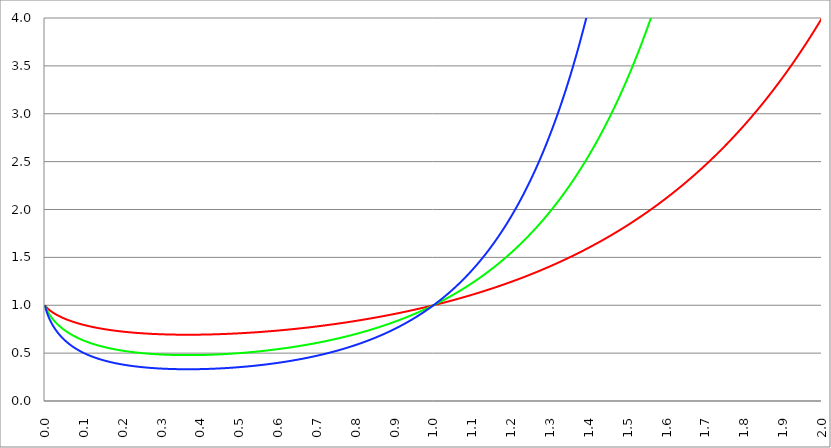
| Category | Series 1 | Series 0 | Series 2 |
|---|---|---|---|
| 0.0 | 1 | 1 | 1 |
| 0.001 | 0.993 | 0.986 | 0.979 |
| 0.002 | 0.988 | 0.975 | 0.963 |
| 0.003 | 0.983 | 0.966 | 0.949 |
| 0.004 | 0.978 | 0.957 | 0.936 |
| 0.005 | 0.974 | 0.948 | 0.924 |
| 0.006 | 0.97 | 0.94 | 0.912 |
| 0.007 | 0.966 | 0.933 | 0.901 |
| 0.008 | 0.962 | 0.926 | 0.891 |
| 0.009 | 0.958 | 0.919 | 0.881 |
| 0.01 | 0.955 | 0.912 | 0.871 |
| 0.011 | 0.952 | 0.906 | 0.862 |
| 0.012 | 0.948 | 0.899 | 0.853 |
| 0.013 | 0.945 | 0.893 | 0.844 |
| 0.014 | 0.942 | 0.887 | 0.836 |
| 0.015 | 0.939 | 0.882 | 0.828 |
| 0.016 | 0.936 | 0.876 | 0.82 |
| 0.017 | 0.933 | 0.871 | 0.812 |
| 0.018 | 0.93 | 0.865 | 0.805 |
| 0.019 | 0.927 | 0.86 | 0.798 |
| 0.02 | 0.925 | 0.855 | 0.791 |
| 0.021 | 0.922 | 0.85 | 0.784 |
| 0.022 | 0.919 | 0.845 | 0.777 |
| 0.023 | 0.917 | 0.841 | 0.771 |
| 0.024 | 0.914 | 0.836 | 0.764 |
| 0.025 | 0.912 | 0.832 | 0.758 |
| 0.026 | 0.909 | 0.827 | 0.752 |
| 0.027 | 0.907 | 0.823 | 0.746 |
| 0.028 | 0.905 | 0.819 | 0.741 |
| 0.029 | 0.902 | 0.814 | 0.735 |
| 0.03 | 0.9 | 0.81 | 0.729 |
| 0.031 | 0.898 | 0.806 | 0.724 |
| 0.032 | 0.896 | 0.802 | 0.719 |
| 0.033 | 0.894 | 0.798 | 0.713 |
| 0.034 | 0.891 | 0.795 | 0.708 |
| 0.035 | 0.889 | 0.791 | 0.703 |
| 0.036 | 0.887 | 0.787 | 0.698 |
| 0.037 | 0.885 | 0.784 | 0.694 |
| 0.038 | 0.883 | 0.78 | 0.689 |
| 0.039 | 0.881 | 0.776 | 0.684 |
| 0.04 | 0.879 | 0.773 | 0.68 |
| 0.041 | 0.877 | 0.77 | 0.675 |
| 0.042 | 0.875 | 0.766 | 0.671 |
| 0.043 | 0.873 | 0.763 | 0.666 |
| 0.044 | 0.872 | 0.76 | 0.662 |
| 0.045 | 0.87 | 0.756 | 0.658 |
| 0.046 | 0.868 | 0.753 | 0.654 |
| 0.047 | 0.866 | 0.75 | 0.65 |
| 0.048 | 0.864 | 0.747 | 0.646 |
| 0.049 | 0.863 | 0.744 | 0.642 |
| 0.05 | 0.861 | 0.741 | 0.638 |
| 0.051 | 0.859 | 0.738 | 0.634 |
| 0.052 | 0.857 | 0.735 | 0.631 |
| 0.053 | 0.856 | 0.732 | 0.627 |
| 0.054 | 0.854 | 0.73 | 0.623 |
| 0.055 | 0.853 | 0.727 | 0.62 |
| 0.056 | 0.851 | 0.724 | 0.616 |
| 0.057 | 0.849 | 0.721 | 0.613 |
| 0.058 | 0.848 | 0.719 | 0.609 |
| 0.059 | 0.846 | 0.716 | 0.606 |
| 0.06 | 0.845 | 0.713 | 0.603 |
| 0.061 | 0.843 | 0.711 | 0.599 |
| 0.062 | 0.842 | 0.708 | 0.596 |
| 0.063 | 0.84 | 0.706 | 0.593 |
| 0.064 | 0.839 | 0.703 | 0.59 |
| 0.065 | 0.837 | 0.701 | 0.587 |
| 0.066 | 0.836 | 0.699 | 0.584 |
| 0.067 | 0.834 | 0.696 | 0.581 |
| 0.068 | 0.833 | 0.694 | 0.578 |
| 0.069 | 0.832 | 0.691 | 0.575 |
| 0.07 | 0.83 | 0.689 | 0.572 |
| 0.071 | 0.829 | 0.687 | 0.569 |
| 0.072 | 0.827 | 0.685 | 0.566 |
| 0.073 | 0.826 | 0.682 | 0.564 |
| 0.074 | 0.825 | 0.68 | 0.561 |
| 0.075 | 0.823 | 0.678 | 0.558 |
| 0.076 | 0.822 | 0.676 | 0.556 |
| 0.077 | 0.821 | 0.674 | 0.553 |
| 0.078 | 0.82 | 0.672 | 0.55 |
| 0.079 | 0.818 | 0.67 | 0.548 |
| 0.08 | 0.817 | 0.668 | 0.545 |
| 0.081 | 0.816 | 0.666 | 0.543 |
| 0.082 | 0.815 | 0.664 | 0.541 |
| 0.083 | 0.813 | 0.662 | 0.538 |
| 0.084 | 0.812 | 0.66 | 0.536 |
| 0.085 | 0.811 | 0.658 | 0.533 |
| 0.086 | 0.81 | 0.656 | 0.531 |
| 0.087 | 0.809 | 0.654 | 0.529 |
| 0.088 | 0.807 | 0.652 | 0.526 |
| 0.089 | 0.806 | 0.65 | 0.524 |
| 0.09 | 0.805 | 0.648 | 0.522 |
| 0.091 | 0.804 | 0.646 | 0.52 |
| 0.092 | 0.803 | 0.645 | 0.518 |
| 0.093 | 0.802 | 0.643 | 0.515 |
| 0.094 | 0.801 | 0.641 | 0.513 |
| 0.095 | 0.8 | 0.639 | 0.511 |
| 0.096 | 0.799 | 0.638 | 0.509 |
| 0.097 | 0.797 | 0.636 | 0.507 |
| 0.098 | 0.796 | 0.634 | 0.505 |
| 0.099 | 0.795 | 0.633 | 0.503 |
| 0.1 | 0.794 | 0.631 | 0.501 |
| 0.101 | 0.793 | 0.629 | 0.499 |
| 0.102 | 0.792 | 0.628 | 0.497 |
| 0.103 | 0.791 | 0.626 | 0.495 |
| 0.104 | 0.79 | 0.625 | 0.494 |
| 0.105 | 0.789 | 0.623 | 0.492 |
| 0.106 | 0.788 | 0.621 | 0.49 |
| 0.107 | 0.787 | 0.62 | 0.488 |
| 0.108 | 0.786 | 0.618 | 0.486 |
| 0.109 | 0.785 | 0.617 | 0.484 |
| 0.11 | 0.784 | 0.615 | 0.483 |
| 0.111 | 0.783 | 0.614 | 0.481 |
| 0.112 | 0.783 | 0.612 | 0.479 |
| 0.113 | 0.782 | 0.611 | 0.478 |
| 0.114 | 0.781 | 0.61 | 0.476 |
| 0.115 | 0.78 | 0.608 | 0.474 |
| 0.116 | 0.779 | 0.607 | 0.473 |
| 0.117 | 0.778 | 0.605 | 0.471 |
| 0.118 | 0.777 | 0.604 | 0.469 |
| 0.119 | 0.776 | 0.603 | 0.468 |
| 0.12 | 0.775 | 0.601 | 0.466 |
| 0.121 | 0.774 | 0.6 | 0.465 |
| 0.122 | 0.774 | 0.599 | 0.463 |
| 0.123 | 0.773 | 0.597 | 0.462 |
| 0.124 | 0.772 | 0.596 | 0.46 |
| 0.125 | 0.771 | 0.595 | 0.459 |
| 0.126 | 0.77 | 0.593 | 0.457 |
| 0.127 | 0.769 | 0.592 | 0.456 |
| 0.128 | 0.769 | 0.591 | 0.454 |
| 0.129 | 0.768 | 0.59 | 0.453 |
| 0.13 | 0.767 | 0.588 | 0.451 |
| 0.131 | 0.766 | 0.587 | 0.45 |
| 0.132 | 0.765 | 0.586 | 0.448 |
| 0.133 | 0.765 | 0.585 | 0.447 |
| 0.134 | 0.764 | 0.584 | 0.446 |
| 0.135 | 0.763 | 0.582 | 0.444 |
| 0.136 | 0.762 | 0.581 | 0.443 |
| 0.137 | 0.762 | 0.58 | 0.442 |
| 0.138 | 0.761 | 0.579 | 0.44 |
| 0.139 | 0.76 | 0.578 | 0.439 |
| 0.14 | 0.759 | 0.577 | 0.438 |
| 0.141 | 0.759 | 0.576 | 0.437 |
| 0.142 | 0.758 | 0.574 | 0.435 |
| 0.143 | 0.757 | 0.573 | 0.434 |
| 0.144 | 0.756 | 0.572 | 0.433 |
| 0.145 | 0.756 | 0.571 | 0.432 |
| 0.146 | 0.755 | 0.57 | 0.431 |
| 0.147 | 0.754 | 0.569 | 0.429 |
| 0.148 | 0.754 | 0.568 | 0.428 |
| 0.149 | 0.753 | 0.567 | 0.427 |
| 0.15 | 0.752 | 0.566 | 0.426 |
| 0.151 | 0.752 | 0.565 | 0.425 |
| 0.152 | 0.751 | 0.564 | 0.424 |
| 0.153 | 0.75 | 0.563 | 0.422 |
| 0.154 | 0.75 | 0.562 | 0.421 |
| 0.155 | 0.749 | 0.561 | 0.42 |
| 0.156 | 0.748 | 0.56 | 0.419 |
| 0.157 | 0.748 | 0.559 | 0.418 |
| 0.158 | 0.747 | 0.558 | 0.417 |
| 0.159 | 0.746 | 0.557 | 0.416 |
| 0.16 | 0.746 | 0.556 | 0.415 |
| 0.161 | 0.745 | 0.555 | 0.414 |
| 0.162 | 0.745 | 0.554 | 0.413 |
| 0.163 | 0.744 | 0.554 | 0.412 |
| 0.164 | 0.743 | 0.553 | 0.411 |
| 0.165 | 0.743 | 0.552 | 0.41 |
| 0.166 | 0.742 | 0.551 | 0.409 |
| 0.167 | 0.742 | 0.55 | 0.408 |
| 0.168 | 0.741 | 0.549 | 0.407 |
| 0.169 | 0.74 | 0.548 | 0.406 |
| 0.17 | 0.74 | 0.547 | 0.405 |
| 0.171 | 0.739 | 0.547 | 0.404 |
| 0.172 | 0.739 | 0.546 | 0.403 |
| 0.173 | 0.738 | 0.545 | 0.402 |
| 0.174 | 0.738 | 0.544 | 0.401 |
| 0.175 | 0.737 | 0.543 | 0.4 |
| 0.176 | 0.737 | 0.543 | 0.4 |
| 0.177 | 0.736 | 0.542 | 0.399 |
| 0.178 | 0.735 | 0.541 | 0.398 |
| 0.179 | 0.735 | 0.54 | 0.397 |
| 0.18 | 0.734 | 0.539 | 0.396 |
| 0.181 | 0.734 | 0.539 | 0.395 |
| 0.182 | 0.733 | 0.538 | 0.394 |
| 0.183 | 0.733 | 0.537 | 0.394 |
| 0.184 | 0.732 | 0.536 | 0.393 |
| 0.185 | 0.732 | 0.536 | 0.392 |
| 0.186 | 0.731 | 0.535 | 0.391 |
| 0.187 | 0.731 | 0.534 | 0.39 |
| 0.188 | 0.73 | 0.533 | 0.39 |
| 0.189 | 0.73 | 0.533 | 0.389 |
| 0.19 | 0.729 | 0.532 | 0.388 |
| 0.191 | 0.729 | 0.531 | 0.387 |
| 0.192 | 0.728 | 0.531 | 0.387 |
| 0.193 | 0.728 | 0.53 | 0.386 |
| 0.194 | 0.728 | 0.529 | 0.385 |
| 0.195 | 0.727 | 0.529 | 0.384 |
| 0.196 | 0.727 | 0.528 | 0.384 |
| 0.197 | 0.726 | 0.527 | 0.383 |
| 0.198 | 0.726 | 0.527 | 0.382 |
| 0.199 | 0.725 | 0.526 | 0.381 |
| 0.2 | 0.725 | 0.525 | 0.381 |
| 0.201 | 0.724 | 0.525 | 0.38 |
| 0.202 | 0.724 | 0.524 | 0.379 |
| 0.203 | 0.723 | 0.523 | 0.379 |
| 0.204 | 0.723 | 0.523 | 0.378 |
| 0.205 | 0.723 | 0.522 | 0.377 |
| 0.206 | 0.722 | 0.522 | 0.377 |
| 0.207 | 0.722 | 0.521 | 0.376 |
| 0.208 | 0.721 | 0.52 | 0.375 |
| 0.209 | 0.721 | 0.52 | 0.375 |
| 0.21 | 0.721 | 0.519 | 0.374 |
| 0.211 | 0.72 | 0.519 | 0.373 |
| 0.212 | 0.72 | 0.518 | 0.373 |
| 0.213 | 0.719 | 0.517 | 0.372 |
| 0.214 | 0.719 | 0.517 | 0.372 |
| 0.215 | 0.719 | 0.516 | 0.371 |
| 0.216 | 0.718 | 0.516 | 0.37 |
| 0.217 | 0.718 | 0.515 | 0.37 |
| 0.218 | 0.717 | 0.515 | 0.369 |
| 0.219 | 0.717 | 0.514 | 0.369 |
| 0.22 | 0.717 | 0.514 | 0.368 |
| 0.221 | 0.716 | 0.513 | 0.368 |
| 0.222 | 0.716 | 0.513 | 0.367 |
| 0.223 | 0.716 | 0.512 | 0.366 |
| 0.224 | 0.715 | 0.512 | 0.366 |
| 0.225 | 0.715 | 0.511 | 0.365 |
| 0.226 | 0.715 | 0.511 | 0.365 |
| 0.227 | 0.714 | 0.51 | 0.364 |
| 0.228 | 0.714 | 0.51 | 0.364 |
| 0.229 | 0.714 | 0.509 | 0.363 |
| 0.23 | 0.713 | 0.509 | 0.363 |
| 0.231 | 0.713 | 0.508 | 0.362 |
| 0.232 | 0.713 | 0.508 | 0.362 |
| 0.233 | 0.712 | 0.507 | 0.361 |
| 0.234 | 0.712 | 0.507 | 0.361 |
| 0.235 | 0.712 | 0.506 | 0.36 |
| 0.236 | 0.711 | 0.506 | 0.36 |
| 0.237 | 0.711 | 0.505 | 0.359 |
| 0.238 | 0.711 | 0.505 | 0.359 |
| 0.239 | 0.71 | 0.505 | 0.358 |
| 0.24 | 0.71 | 0.504 | 0.358 |
| 0.241 | 0.71 | 0.504 | 0.357 |
| 0.242 | 0.709 | 0.503 | 0.357 |
| 0.243 | 0.709 | 0.503 | 0.357 |
| 0.244 | 0.709 | 0.502 | 0.356 |
| 0.245 | 0.709 | 0.502 | 0.356 |
| 0.246 | 0.708 | 0.502 | 0.355 |
| 0.247 | 0.708 | 0.501 | 0.355 |
| 0.248 | 0.708 | 0.501 | 0.354 |
| 0.249 | 0.707 | 0.5 | 0.354 |
| 0.25 | 0.707 | 0.5 | 0.354 |
| 0.251 | 0.707 | 0.5 | 0.353 |
| 0.252 | 0.707 | 0.499 | 0.353 |
| 0.253 | 0.706 | 0.499 | 0.352 |
| 0.254 | 0.706 | 0.498 | 0.352 |
| 0.255 | 0.706 | 0.498 | 0.352 |
| 0.256 | 0.706 | 0.498 | 0.351 |
| 0.257 | 0.705 | 0.497 | 0.351 |
| 0.258 | 0.705 | 0.497 | 0.35 |
| 0.259 | 0.705 | 0.497 | 0.35 |
| 0.26 | 0.705 | 0.496 | 0.35 |
| 0.261 | 0.704 | 0.496 | 0.349 |
| 0.262 | 0.704 | 0.496 | 0.349 |
| 0.263 | 0.704 | 0.495 | 0.349 |
| 0.264 | 0.704 | 0.495 | 0.348 |
| 0.265 | 0.703 | 0.495 | 0.348 |
| 0.266 | 0.703 | 0.494 | 0.348 |
| 0.267 | 0.703 | 0.494 | 0.347 |
| 0.268 | 0.703 | 0.494 | 0.347 |
| 0.269 | 0.702 | 0.493 | 0.347 |
| 0.27 | 0.702 | 0.493 | 0.346 |
| 0.271 | 0.702 | 0.493 | 0.346 |
| 0.272 | 0.702 | 0.492 | 0.346 |
| 0.273 | 0.702 | 0.492 | 0.345 |
| 0.274 | 0.701 | 0.492 | 0.345 |
| 0.275 | 0.701 | 0.492 | 0.345 |
| 0.276 | 0.701 | 0.491 | 0.344 |
| 0.277 | 0.701 | 0.491 | 0.344 |
| 0.278 | 0.701 | 0.491 | 0.344 |
| 0.279 | 0.7 | 0.491 | 0.344 |
| 0.28 | 0.7 | 0.49 | 0.343 |
| 0.281 | 0.7 | 0.49 | 0.343 |
| 0.282 | 0.7 | 0.49 | 0.343 |
| 0.283 | 0.7 | 0.489 | 0.342 |
| 0.284 | 0.699 | 0.489 | 0.342 |
| 0.285 | 0.699 | 0.489 | 0.342 |
| 0.286 | 0.699 | 0.489 | 0.342 |
| 0.287 | 0.699 | 0.488 | 0.341 |
| 0.288 | 0.699 | 0.488 | 0.341 |
| 0.289 | 0.699 | 0.488 | 0.341 |
| 0.29 | 0.698 | 0.488 | 0.341 |
| 0.291 | 0.698 | 0.488 | 0.34 |
| 0.292 | 0.698 | 0.487 | 0.34 |
| 0.293 | 0.698 | 0.487 | 0.34 |
| 0.294 | 0.698 | 0.487 | 0.34 |
| 0.295 | 0.698 | 0.487 | 0.339 |
| 0.296 | 0.697 | 0.486 | 0.339 |
| 0.297 | 0.697 | 0.486 | 0.339 |
| 0.298 | 0.697 | 0.486 | 0.339 |
| 0.299 | 0.697 | 0.486 | 0.339 |
| 0.3 | 0.697 | 0.486 | 0.338 |
| 0.301 | 0.697 | 0.485 | 0.338 |
| 0.302 | 0.697 | 0.485 | 0.338 |
| 0.303 | 0.696 | 0.485 | 0.338 |
| 0.304 | 0.696 | 0.485 | 0.338 |
| 0.305 | 0.696 | 0.485 | 0.337 |
| 0.306 | 0.696 | 0.484 | 0.337 |
| 0.307 | 0.696 | 0.484 | 0.337 |
| 0.308 | 0.696 | 0.484 | 0.337 |
| 0.309 | 0.696 | 0.484 | 0.337 |
| 0.31 | 0.696 | 0.484 | 0.336 |
| 0.311 | 0.695 | 0.484 | 0.336 |
| 0.312 | 0.695 | 0.483 | 0.336 |
| 0.313 | 0.695 | 0.483 | 0.336 |
| 0.314 | 0.695 | 0.483 | 0.336 |
| 0.315 | 0.695 | 0.483 | 0.336 |
| 0.316 | 0.695 | 0.483 | 0.336 |
| 0.317 | 0.695 | 0.483 | 0.335 |
| 0.318 | 0.695 | 0.483 | 0.335 |
| 0.319 | 0.695 | 0.482 | 0.335 |
| 0.32 | 0.694 | 0.482 | 0.335 |
| 0.321 | 0.694 | 0.482 | 0.335 |
| 0.322 | 0.694 | 0.482 | 0.335 |
| 0.323 | 0.694 | 0.482 | 0.335 |
| 0.324 | 0.694 | 0.482 | 0.334 |
| 0.325 | 0.694 | 0.482 | 0.334 |
| 0.326 | 0.694 | 0.482 | 0.334 |
| 0.327 | 0.694 | 0.481 | 0.334 |
| 0.328 | 0.694 | 0.481 | 0.334 |
| 0.329 | 0.694 | 0.481 | 0.334 |
| 0.33 | 0.694 | 0.481 | 0.334 |
| 0.331 | 0.694 | 0.481 | 0.334 |
| 0.332 | 0.693 | 0.481 | 0.333 |
| 0.333 | 0.693 | 0.481 | 0.333 |
| 0.334 | 0.693 | 0.481 | 0.333 |
| 0.335 | 0.693 | 0.481 | 0.333 |
| 0.336 | 0.693 | 0.481 | 0.333 |
| 0.337 | 0.693 | 0.48 | 0.333 |
| 0.338 | 0.693 | 0.48 | 0.333 |
| 0.339 | 0.693 | 0.48 | 0.333 |
| 0.34 | 0.693 | 0.48 | 0.333 |
| 0.341 | 0.693 | 0.48 | 0.333 |
| 0.342 | 0.693 | 0.48 | 0.333 |
| 0.343 | 0.693 | 0.48 | 0.333 |
| 0.344 | 0.693 | 0.48 | 0.332 |
| 0.345 | 0.693 | 0.48 | 0.332 |
| 0.346 | 0.693 | 0.48 | 0.332 |
| 0.347 | 0.693 | 0.48 | 0.332 |
| 0.348 | 0.693 | 0.48 | 0.332 |
| 0.349 | 0.693 | 0.48 | 0.332 |
| 0.35 | 0.693 | 0.48 | 0.332 |
| 0.351 | 0.692 | 0.48 | 0.332 |
| 0.352 | 0.692 | 0.479 | 0.332 |
| 0.353 | 0.692 | 0.479 | 0.332 |
| 0.354 | 0.692 | 0.479 | 0.332 |
| 0.355 | 0.692 | 0.479 | 0.332 |
| 0.356 | 0.692 | 0.479 | 0.332 |
| 0.357 | 0.692 | 0.479 | 0.332 |
| 0.358 | 0.692 | 0.479 | 0.332 |
| 0.359 | 0.692 | 0.479 | 0.332 |
| 0.36 | 0.692 | 0.479 | 0.332 |
| 0.361 | 0.692 | 0.479 | 0.332 |
| 0.362 | 0.692 | 0.479 | 0.332 |
| 0.363 | 0.692 | 0.479 | 0.332 |
| 0.364 | 0.692 | 0.479 | 0.332 |
| 0.365 | 0.692 | 0.479 | 0.332 |
| 0.366 | 0.692 | 0.479 | 0.332 |
| 0.367 | 0.692 | 0.479 | 0.332 |
| 0.368 | 0.692 | 0.479 | 0.332 |
| 0.369 | 0.692 | 0.479 | 0.332 |
| 0.37 | 0.692 | 0.479 | 0.332 |
| 0.371 | 0.692 | 0.479 | 0.332 |
| 0.372 | 0.692 | 0.479 | 0.332 |
| 0.373 | 0.692 | 0.479 | 0.332 |
| 0.374 | 0.692 | 0.479 | 0.332 |
| 0.375 | 0.692 | 0.479 | 0.332 |
| 0.376 | 0.692 | 0.479 | 0.332 |
| 0.377 | 0.692 | 0.479 | 0.332 |
| 0.378 | 0.692 | 0.479 | 0.332 |
| 0.379 | 0.692 | 0.479 | 0.332 |
| 0.38 | 0.692 | 0.479 | 0.332 |
| 0.381 | 0.692 | 0.479 | 0.332 |
| 0.382 | 0.692 | 0.479 | 0.332 |
| 0.383 | 0.692 | 0.479 | 0.332 |
| 0.384 | 0.692 | 0.479 | 0.332 |
| 0.385 | 0.692 | 0.48 | 0.332 |
| 0.386 | 0.693 | 0.48 | 0.332 |
| 0.387 | 0.693 | 0.48 | 0.332 |
| 0.388 | 0.693 | 0.48 | 0.332 |
| 0.389 | 0.693 | 0.48 | 0.332 |
| 0.39 | 0.693 | 0.48 | 0.332 |
| 0.391 | 0.693 | 0.48 | 0.332 |
| 0.392 | 0.693 | 0.48 | 0.332 |
| 0.393 | 0.693 | 0.48 | 0.332 |
| 0.394 | 0.693 | 0.48 | 0.333 |
| 0.395 | 0.693 | 0.48 | 0.333 |
| 0.396 | 0.693 | 0.48 | 0.333 |
| 0.397 | 0.693 | 0.48 | 0.333 |
| 0.398 | 0.693 | 0.48 | 0.333 |
| 0.399 | 0.693 | 0.48 | 0.333 |
| 0.4 | 0.693 | 0.48 | 0.333 |
| 0.401 | 0.693 | 0.481 | 0.333 |
| 0.402 | 0.693 | 0.481 | 0.333 |
| 0.403 | 0.693 | 0.481 | 0.333 |
| 0.404 | 0.693 | 0.481 | 0.333 |
| 0.405 | 0.693 | 0.481 | 0.333 |
| 0.406 | 0.694 | 0.481 | 0.334 |
| 0.407 | 0.694 | 0.481 | 0.334 |
| 0.408 | 0.694 | 0.481 | 0.334 |
| 0.409 | 0.694 | 0.481 | 0.334 |
| 0.41 | 0.694 | 0.481 | 0.334 |
| 0.411 | 0.694 | 0.481 | 0.334 |
| 0.412 | 0.694 | 0.482 | 0.334 |
| 0.413 | 0.694 | 0.482 | 0.334 |
| 0.414 | 0.694 | 0.482 | 0.334 |
| 0.415 | 0.694 | 0.482 | 0.335 |
| 0.416 | 0.694 | 0.482 | 0.335 |
| 0.417 | 0.694 | 0.482 | 0.335 |
| 0.418 | 0.694 | 0.482 | 0.335 |
| 0.419 | 0.695 | 0.482 | 0.335 |
| 0.42 | 0.695 | 0.483 | 0.335 |
| 0.421 | 0.695 | 0.483 | 0.335 |
| 0.422 | 0.695 | 0.483 | 0.335 |
| 0.423 | 0.695 | 0.483 | 0.336 |
| 0.424 | 0.695 | 0.483 | 0.336 |
| 0.425 | 0.695 | 0.483 | 0.336 |
| 0.426 | 0.695 | 0.483 | 0.336 |
| 0.427 | 0.695 | 0.483 | 0.336 |
| 0.428 | 0.695 | 0.484 | 0.336 |
| 0.429 | 0.696 | 0.484 | 0.336 |
| 0.43 | 0.696 | 0.484 | 0.337 |
| 0.431 | 0.696 | 0.484 | 0.337 |
| 0.432 | 0.696 | 0.484 | 0.337 |
| 0.433 | 0.696 | 0.484 | 0.337 |
| 0.434 | 0.696 | 0.485 | 0.337 |
| 0.435 | 0.696 | 0.485 | 0.337 |
| 0.436 | 0.696 | 0.485 | 0.338 |
| 0.437 | 0.696 | 0.485 | 0.338 |
| 0.438 | 0.697 | 0.485 | 0.338 |
| 0.439 | 0.697 | 0.485 | 0.338 |
| 0.44 | 0.697 | 0.486 | 0.338 |
| 0.441 | 0.697 | 0.486 | 0.339 |
| 0.442 | 0.697 | 0.486 | 0.339 |
| 0.443 | 0.697 | 0.486 | 0.339 |
| 0.444 | 0.697 | 0.486 | 0.339 |
| 0.445 | 0.697 | 0.486 | 0.339 |
| 0.446 | 0.698 | 0.487 | 0.339 |
| 0.447 | 0.698 | 0.487 | 0.34 |
| 0.448 | 0.698 | 0.487 | 0.34 |
| 0.449 | 0.698 | 0.487 | 0.34 |
| 0.45 | 0.698 | 0.487 | 0.34 |
| 0.451 | 0.698 | 0.488 | 0.34 |
| 0.452 | 0.698 | 0.488 | 0.341 |
| 0.453 | 0.699 | 0.488 | 0.341 |
| 0.454 | 0.699 | 0.488 | 0.341 |
| 0.455 | 0.699 | 0.488 | 0.341 |
| 0.456 | 0.699 | 0.489 | 0.342 |
| 0.457 | 0.699 | 0.489 | 0.342 |
| 0.458 | 0.699 | 0.489 | 0.342 |
| 0.459 | 0.699 | 0.489 | 0.342 |
| 0.46 | 0.7 | 0.489 | 0.342 |
| 0.461 | 0.7 | 0.49 | 0.343 |
| 0.462 | 0.7 | 0.49 | 0.343 |
| 0.463 | 0.7 | 0.49 | 0.343 |
| 0.464 | 0.7 | 0.49 | 0.343 |
| 0.465 | 0.7 | 0.491 | 0.344 |
| 0.466 | 0.701 | 0.491 | 0.344 |
| 0.467 | 0.701 | 0.491 | 0.344 |
| 0.468 | 0.701 | 0.491 | 0.344 |
| 0.469 | 0.701 | 0.492 | 0.345 |
| 0.47 | 0.701 | 0.492 | 0.345 |
| 0.471 | 0.701 | 0.492 | 0.345 |
| 0.472 | 0.702 | 0.492 | 0.345 |
| 0.473 | 0.702 | 0.493 | 0.346 |
| 0.474 | 0.702 | 0.493 | 0.346 |
| 0.475 | 0.702 | 0.493 | 0.346 |
| 0.476 | 0.702 | 0.493 | 0.346 |
| 0.477 | 0.703 | 0.494 | 0.347 |
| 0.478 | 0.703 | 0.494 | 0.347 |
| 0.479 | 0.703 | 0.494 | 0.347 |
| 0.48 | 0.703 | 0.494 | 0.348 |
| 0.481 | 0.703 | 0.495 | 0.348 |
| 0.482 | 0.703 | 0.495 | 0.348 |
| 0.483 | 0.704 | 0.495 | 0.348 |
| 0.484 | 0.704 | 0.495 | 0.349 |
| 0.485 | 0.704 | 0.496 | 0.349 |
| 0.486 | 0.704 | 0.496 | 0.349 |
| 0.487 | 0.704 | 0.496 | 0.35 |
| 0.488 | 0.705 | 0.496 | 0.35 |
| 0.489 | 0.705 | 0.497 | 0.35 |
| 0.49 | 0.705 | 0.497 | 0.35 |
| 0.491 | 0.705 | 0.497 | 0.351 |
| 0.492 | 0.705 | 0.498 | 0.351 |
| 0.493 | 0.706 | 0.498 | 0.351 |
| 0.494 | 0.706 | 0.498 | 0.352 |
| 0.495 | 0.706 | 0.498 | 0.352 |
| 0.496 | 0.706 | 0.499 | 0.352 |
| 0.497 | 0.706 | 0.499 | 0.353 |
| 0.498 | 0.707 | 0.499 | 0.353 |
| 0.499 | 0.707 | 0.5 | 0.353 |
| 0.5 | 0.707 | 0.5 | 0.354 |
| 0.501 | 0.707 | 0.5 | 0.354 |
| 0.502 | 0.708 | 0.501 | 0.354 |
| 0.503 | 0.708 | 0.501 | 0.355 |
| 0.504 | 0.708 | 0.501 | 0.355 |
| 0.505 | 0.708 | 0.502 | 0.355 |
| 0.506 | 0.708 | 0.502 | 0.356 |
| 0.507 | 0.709 | 0.502 | 0.356 |
| 0.508 | 0.709 | 0.503 | 0.356 |
| 0.509 | 0.709 | 0.503 | 0.357 |
| 0.51 | 0.709 | 0.503 | 0.357 |
| 0.511 | 0.71 | 0.504 | 0.357 |
| 0.512 | 0.71 | 0.504 | 0.358 |
| 0.513 | 0.71 | 0.504 | 0.358 |
| 0.514 | 0.71 | 0.505 | 0.358 |
| 0.515 | 0.711 | 0.505 | 0.359 |
| 0.516 | 0.711 | 0.505 | 0.359 |
| 0.517 | 0.711 | 0.506 | 0.359 |
| 0.518 | 0.711 | 0.506 | 0.36 |
| 0.519 | 0.711 | 0.506 | 0.36 |
| 0.52 | 0.712 | 0.507 | 0.361 |
| 0.521 | 0.712 | 0.507 | 0.361 |
| 0.522 | 0.712 | 0.507 | 0.361 |
| 0.523 | 0.712 | 0.508 | 0.362 |
| 0.524 | 0.713 | 0.508 | 0.362 |
| 0.525 | 0.713 | 0.508 | 0.362 |
| 0.526 | 0.713 | 0.509 | 0.363 |
| 0.527 | 0.714 | 0.509 | 0.363 |
| 0.528 | 0.714 | 0.509 | 0.364 |
| 0.529 | 0.714 | 0.51 | 0.364 |
| 0.53 | 0.714 | 0.51 | 0.364 |
| 0.531 | 0.715 | 0.511 | 0.365 |
| 0.532 | 0.715 | 0.511 | 0.365 |
| 0.533 | 0.715 | 0.511 | 0.366 |
| 0.534 | 0.715 | 0.512 | 0.366 |
| 0.535 | 0.716 | 0.512 | 0.366 |
| 0.536 | 0.716 | 0.512 | 0.367 |
| 0.537 | 0.716 | 0.513 | 0.367 |
| 0.538 | 0.716 | 0.513 | 0.368 |
| 0.539 | 0.717 | 0.514 | 0.368 |
| 0.54 | 0.717 | 0.514 | 0.369 |
| 0.541 | 0.717 | 0.514 | 0.369 |
| 0.542 | 0.718 | 0.515 | 0.369 |
| 0.543 | 0.718 | 0.515 | 0.37 |
| 0.544 | 0.718 | 0.516 | 0.37 |
| 0.545 | 0.718 | 0.516 | 0.371 |
| 0.546 | 0.719 | 0.516 | 0.371 |
| 0.547 | 0.719 | 0.517 | 0.372 |
| 0.548 | 0.719 | 0.517 | 0.372 |
| 0.549 | 0.719 | 0.518 | 0.372 |
| 0.55 | 0.72 | 0.518 | 0.373 |
| 0.551 | 0.72 | 0.519 | 0.373 |
| 0.552 | 0.72 | 0.519 | 0.374 |
| 0.553 | 0.721 | 0.519 | 0.374 |
| 0.554 | 0.721 | 0.52 | 0.375 |
| 0.555 | 0.721 | 0.52 | 0.375 |
| 0.556 | 0.722 | 0.521 | 0.376 |
| 0.557 | 0.722 | 0.521 | 0.376 |
| 0.558 | 0.722 | 0.521 | 0.377 |
| 0.559 | 0.722 | 0.522 | 0.377 |
| 0.56 | 0.723 | 0.522 | 0.378 |
| 0.561 | 0.723 | 0.523 | 0.378 |
| 0.562 | 0.723 | 0.523 | 0.378 |
| 0.563 | 0.724 | 0.524 | 0.379 |
| 0.564 | 0.724 | 0.524 | 0.379 |
| 0.565 | 0.724 | 0.525 | 0.38 |
| 0.566 | 0.725 | 0.525 | 0.38 |
| 0.567 | 0.725 | 0.525 | 0.381 |
| 0.568 | 0.725 | 0.526 | 0.381 |
| 0.569 | 0.726 | 0.526 | 0.382 |
| 0.57 | 0.726 | 0.527 | 0.382 |
| 0.571 | 0.726 | 0.527 | 0.383 |
| 0.572 | 0.726 | 0.528 | 0.383 |
| 0.573 | 0.727 | 0.528 | 0.384 |
| 0.574 | 0.727 | 0.529 | 0.384 |
| 0.575 | 0.727 | 0.529 | 0.385 |
| 0.576 | 0.728 | 0.53 | 0.385 |
| 0.577 | 0.728 | 0.53 | 0.386 |
| 0.578 | 0.728 | 0.531 | 0.387 |
| 0.579 | 0.729 | 0.531 | 0.387 |
| 0.58 | 0.729 | 0.532 | 0.388 |
| 0.581 | 0.729 | 0.532 | 0.388 |
| 0.582 | 0.73 | 0.533 | 0.389 |
| 0.583 | 0.73 | 0.533 | 0.389 |
| 0.584 | 0.73 | 0.534 | 0.39 |
| 0.585 | 0.731 | 0.534 | 0.39 |
| 0.586 | 0.731 | 0.535 | 0.391 |
| 0.587 | 0.731 | 0.535 | 0.391 |
| 0.588 | 0.732 | 0.536 | 0.392 |
| 0.589 | 0.732 | 0.536 | 0.392 |
| 0.59 | 0.732 | 0.537 | 0.393 |
| 0.591 | 0.733 | 0.537 | 0.394 |
| 0.592 | 0.733 | 0.538 | 0.394 |
| 0.593 | 0.734 | 0.538 | 0.395 |
| 0.594 | 0.734 | 0.539 | 0.395 |
| 0.595 | 0.734 | 0.539 | 0.396 |
| 0.596 | 0.735 | 0.54 | 0.396 |
| 0.597 | 0.735 | 0.54 | 0.397 |
| 0.598 | 0.735 | 0.541 | 0.398 |
| 0.599 | 0.736 | 0.541 | 0.398 |
| 0.6 | 0.736 | 0.542 | 0.399 |
| 0.601 | 0.736 | 0.542 | 0.399 |
| 0.602 | 0.737 | 0.543 | 0.4 |
| 0.603 | 0.737 | 0.543 | 0.4 |
| 0.604 | 0.737 | 0.544 | 0.401 |
| 0.605 | 0.738 | 0.544 | 0.402 |
| 0.606 | 0.738 | 0.545 | 0.402 |
| 0.607 | 0.739 | 0.545 | 0.403 |
| 0.608 | 0.739 | 0.546 | 0.403 |
| 0.609 | 0.739 | 0.547 | 0.404 |
| 0.61 | 0.74 | 0.547 | 0.405 |
| 0.611 | 0.74 | 0.548 | 0.405 |
| 0.612 | 0.74 | 0.548 | 0.406 |
| 0.613 | 0.741 | 0.549 | 0.407 |
| 0.614 | 0.741 | 0.549 | 0.407 |
| 0.615 | 0.742 | 0.55 | 0.408 |
| 0.616 | 0.742 | 0.551 | 0.408 |
| 0.617 | 0.742 | 0.551 | 0.409 |
| 0.618 | 0.743 | 0.552 | 0.41 |
| 0.619 | 0.743 | 0.552 | 0.41 |
| 0.62 | 0.744 | 0.553 | 0.411 |
| 0.621 | 0.744 | 0.553 | 0.412 |
| 0.622 | 0.744 | 0.554 | 0.412 |
| 0.623 | 0.745 | 0.555 | 0.413 |
| 0.624 | 0.745 | 0.555 | 0.414 |
| 0.625 | 0.745 | 0.556 | 0.414 |
| 0.626 | 0.746 | 0.556 | 0.415 |
| 0.627 | 0.746 | 0.557 | 0.416 |
| 0.628 | 0.747 | 0.557 | 0.416 |
| 0.629 | 0.747 | 0.558 | 0.417 |
| 0.63 | 0.747 | 0.559 | 0.418 |
| 0.631 | 0.748 | 0.559 | 0.418 |
| 0.632 | 0.748 | 0.56 | 0.419 |
| 0.633 | 0.749 | 0.561 | 0.42 |
| 0.634 | 0.749 | 0.561 | 0.42 |
| 0.635 | 0.749 | 0.562 | 0.421 |
| 0.636 | 0.75 | 0.562 | 0.422 |
| 0.637 | 0.75 | 0.563 | 0.422 |
| 0.638 | 0.751 | 0.564 | 0.423 |
| 0.639 | 0.751 | 0.564 | 0.424 |
| 0.64 | 0.752 | 0.565 | 0.424 |
| 0.641 | 0.752 | 0.565 | 0.425 |
| 0.642 | 0.752 | 0.566 | 0.426 |
| 0.643 | 0.753 | 0.567 | 0.427 |
| 0.644 | 0.753 | 0.567 | 0.427 |
| 0.645 | 0.754 | 0.568 | 0.428 |
| 0.646 | 0.754 | 0.569 | 0.429 |
| 0.647 | 0.754 | 0.569 | 0.43 |
| 0.648 | 0.755 | 0.57 | 0.43 |
| 0.649 | 0.755 | 0.571 | 0.431 |
| 0.65 | 0.756 | 0.571 | 0.432 |
| 0.651 | 0.756 | 0.572 | 0.432 |
| 0.652 | 0.757 | 0.573 | 0.433 |
| 0.653 | 0.757 | 0.573 | 0.434 |
| 0.654 | 0.758 | 0.574 | 0.435 |
| 0.655 | 0.758 | 0.574 | 0.435 |
| 0.656 | 0.758 | 0.575 | 0.436 |
| 0.657 | 0.759 | 0.576 | 0.437 |
| 0.658 | 0.759 | 0.576 | 0.438 |
| 0.659 | 0.76 | 0.577 | 0.438 |
| 0.66 | 0.76 | 0.578 | 0.439 |
| 0.661 | 0.761 | 0.579 | 0.44 |
| 0.662 | 0.761 | 0.579 | 0.441 |
| 0.663 | 0.761 | 0.58 | 0.442 |
| 0.664 | 0.762 | 0.581 | 0.442 |
| 0.665 | 0.762 | 0.581 | 0.443 |
| 0.666 | 0.763 | 0.582 | 0.444 |
| 0.667 | 0.763 | 0.583 | 0.445 |
| 0.668 | 0.764 | 0.583 | 0.446 |
| 0.669 | 0.764 | 0.584 | 0.446 |
| 0.67 | 0.765 | 0.585 | 0.447 |
| 0.671 | 0.765 | 0.585 | 0.448 |
| 0.672 | 0.766 | 0.586 | 0.449 |
| 0.673 | 0.766 | 0.587 | 0.45 |
| 0.674 | 0.767 | 0.588 | 0.45 |
| 0.675 | 0.767 | 0.588 | 0.451 |
| 0.676 | 0.767 | 0.589 | 0.452 |
| 0.677 | 0.768 | 0.59 | 0.453 |
| 0.678 | 0.768 | 0.59 | 0.454 |
| 0.679 | 0.769 | 0.591 | 0.454 |
| 0.68 | 0.769 | 0.592 | 0.455 |
| 0.681 | 0.77 | 0.593 | 0.456 |
| 0.682 | 0.77 | 0.593 | 0.457 |
| 0.683 | 0.771 | 0.594 | 0.458 |
| 0.684 | 0.771 | 0.595 | 0.459 |
| 0.685 | 0.772 | 0.596 | 0.46 |
| 0.686 | 0.772 | 0.596 | 0.46 |
| 0.687 | 0.773 | 0.597 | 0.461 |
| 0.688 | 0.773 | 0.598 | 0.462 |
| 0.689 | 0.774 | 0.599 | 0.463 |
| 0.69 | 0.774 | 0.599 | 0.464 |
| 0.691 | 0.775 | 0.6 | 0.465 |
| 0.692 | 0.775 | 0.601 | 0.466 |
| 0.693 | 0.776 | 0.602 | 0.467 |
| 0.694 | 0.776 | 0.602 | 0.467 |
| 0.695 | 0.777 | 0.603 | 0.468 |
| 0.696 | 0.777 | 0.604 | 0.469 |
| 0.697 | 0.778 | 0.605 | 0.47 |
| 0.698 | 0.778 | 0.605 | 0.471 |
| 0.699 | 0.779 | 0.606 | 0.472 |
| 0.7 | 0.779 | 0.607 | 0.473 |
| 0.701 | 0.78 | 0.608 | 0.474 |
| 0.702 | 0.78 | 0.608 | 0.475 |
| 0.703 | 0.781 | 0.609 | 0.476 |
| 0.704 | 0.781 | 0.61 | 0.477 |
| 0.705 | 0.782 | 0.611 | 0.477 |
| 0.706 | 0.782 | 0.612 | 0.478 |
| 0.707 | 0.783 | 0.612 | 0.479 |
| 0.708 | 0.783 | 0.613 | 0.48 |
| 0.709 | 0.784 | 0.614 | 0.481 |
| 0.71 | 0.784 | 0.615 | 0.482 |
| 0.711 | 0.785 | 0.616 | 0.483 |
| 0.712 | 0.785 | 0.616 | 0.484 |
| 0.713 | 0.786 | 0.617 | 0.485 |
| 0.714 | 0.786 | 0.618 | 0.486 |
| 0.715 | 0.787 | 0.619 | 0.487 |
| 0.716 | 0.787 | 0.62 | 0.488 |
| 0.717 | 0.788 | 0.621 | 0.489 |
| 0.718 | 0.788 | 0.621 | 0.49 |
| 0.719 | 0.789 | 0.622 | 0.491 |
| 0.72 | 0.789 | 0.623 | 0.492 |
| 0.721 | 0.79 | 0.624 | 0.493 |
| 0.722 | 0.79 | 0.625 | 0.494 |
| 0.723 | 0.791 | 0.626 | 0.495 |
| 0.724 | 0.791 | 0.626 | 0.496 |
| 0.725 | 0.792 | 0.627 | 0.497 |
| 0.726 | 0.793 | 0.628 | 0.498 |
| 0.727 | 0.793 | 0.629 | 0.499 |
| 0.728 | 0.794 | 0.63 | 0.5 |
| 0.729 | 0.794 | 0.631 | 0.501 |
| 0.73 | 0.795 | 0.632 | 0.502 |
| 0.731 | 0.795 | 0.632 | 0.503 |
| 0.732 | 0.796 | 0.633 | 0.504 |
| 0.733 | 0.796 | 0.634 | 0.505 |
| 0.734 | 0.797 | 0.635 | 0.506 |
| 0.735 | 0.797 | 0.636 | 0.507 |
| 0.736 | 0.798 | 0.637 | 0.508 |
| 0.737 | 0.799 | 0.638 | 0.509 |
| 0.738 | 0.799 | 0.639 | 0.51 |
| 0.739 | 0.8 | 0.64 | 0.511 |
| 0.74 | 0.8 | 0.64 | 0.513 |
| 0.741 | 0.801 | 0.641 | 0.514 |
| 0.742 | 0.801 | 0.642 | 0.515 |
| 0.743 | 0.802 | 0.643 | 0.516 |
| 0.744 | 0.803 | 0.644 | 0.517 |
| 0.745 | 0.803 | 0.645 | 0.518 |
| 0.746 | 0.804 | 0.646 | 0.519 |
| 0.747 | 0.804 | 0.647 | 0.52 |
| 0.748 | 0.805 | 0.648 | 0.521 |
| 0.749 | 0.805 | 0.649 | 0.522 |
| 0.75 | 0.806 | 0.65 | 0.523 |
| 0.751 | 0.807 | 0.65 | 0.525 |
| 0.752 | 0.807 | 0.651 | 0.526 |
| 0.753 | 0.808 | 0.652 | 0.527 |
| 0.754 | 0.808 | 0.653 | 0.528 |
| 0.755 | 0.809 | 0.654 | 0.529 |
| 0.756 | 0.809 | 0.655 | 0.53 |
| 0.757 | 0.81 | 0.656 | 0.531 |
| 0.758 | 0.811 | 0.657 | 0.533 |
| 0.759 | 0.811 | 0.658 | 0.534 |
| 0.76 | 0.812 | 0.659 | 0.535 |
| 0.761 | 0.812 | 0.66 | 0.536 |
| 0.762 | 0.813 | 0.661 | 0.537 |
| 0.763 | 0.814 | 0.662 | 0.538 |
| 0.764 | 0.814 | 0.663 | 0.54 |
| 0.765 | 0.815 | 0.664 | 0.541 |
| 0.766 | 0.815 | 0.665 | 0.542 |
| 0.767 | 0.816 | 0.666 | 0.543 |
| 0.768 | 0.817 | 0.667 | 0.544 |
| 0.769 | 0.817 | 0.668 | 0.546 |
| 0.77 | 0.818 | 0.669 | 0.547 |
| 0.771000000000001 | 0.818 | 0.67 | 0.548 |
| 0.772000000000001 | 0.819 | 0.671 | 0.549 |
| 0.773000000000001 | 0.82 | 0.672 | 0.55 |
| 0.774000000000001 | 0.82 | 0.673 | 0.552 |
| 0.775000000000001 | 0.821 | 0.674 | 0.553 |
| 0.776000000000001 | 0.821 | 0.675 | 0.554 |
| 0.777000000000001 | 0.822 | 0.676 | 0.555 |
| 0.778000000000001 | 0.823 | 0.677 | 0.557 |
| 0.779000000000001 | 0.823 | 0.678 | 0.558 |
| 0.78 | 0.824 | 0.679 | 0.559 |
| 0.781000000000001 | 0.824 | 0.68 | 0.56 |
| 0.782000000000001 | 0.825 | 0.681 | 0.562 |
| 0.783000000000001 | 0.826 | 0.682 | 0.563 |
| 0.784000000000001 | 0.826 | 0.683 | 0.564 |
| 0.785000000000001 | 0.827 | 0.684 | 0.565 |
| 0.786000000000001 | 0.828 | 0.685 | 0.567 |
| 0.787000000000001 | 0.828 | 0.686 | 0.568 |
| 0.788000000000001 | 0.829 | 0.687 | 0.569 |
| 0.789000000000001 | 0.829 | 0.688 | 0.571 |
| 0.79 | 0.83 | 0.689 | 0.572 |
| 0.791000000000001 | 0.831 | 0.69 | 0.573 |
| 0.792000000000001 | 0.831 | 0.691 | 0.575 |
| 0.793000000000001 | 0.832 | 0.692 | 0.576 |
| 0.794000000000001 | 0.833 | 0.693 | 0.577 |
| 0.795000000000001 | 0.833 | 0.694 | 0.579 |
| 0.796000000000001 | 0.834 | 0.695 | 0.58 |
| 0.797000000000001 | 0.835 | 0.697 | 0.581 |
| 0.798000000000001 | 0.835 | 0.698 | 0.583 |
| 0.799000000000001 | 0.836 | 0.699 | 0.584 |
| 0.800000000000001 | 0.837 | 0.7 | 0.585 |
| 0.801000000000001 | 0.837 | 0.701 | 0.587 |
| 0.802000000000001 | 0.838 | 0.702 | 0.588 |
| 0.803000000000001 | 0.838 | 0.703 | 0.589 |
| 0.804000000000001 | 0.839 | 0.704 | 0.591 |
| 0.805000000000001 | 0.84 | 0.705 | 0.592 |
| 0.806000000000001 | 0.84 | 0.706 | 0.594 |
| 0.807000000000001 | 0.841 | 0.707 | 0.595 |
| 0.808000000000001 | 0.842 | 0.709 | 0.596 |
| 0.809000000000001 | 0.842 | 0.71 | 0.598 |
| 0.810000000000001 | 0.843 | 0.711 | 0.599 |
| 0.811000000000001 | 0.844 | 0.712 | 0.601 |
| 0.812000000000001 | 0.844 | 0.713 | 0.602 |
| 0.813000000000001 | 0.845 | 0.714 | 0.604 |
| 0.814000000000001 | 0.846 | 0.715 | 0.605 |
| 0.815000000000001 | 0.846 | 0.716 | 0.606 |
| 0.816000000000001 | 0.847 | 0.718 | 0.608 |
| 0.817000000000001 | 0.848 | 0.719 | 0.609 |
| 0.818000000000001 | 0.848 | 0.72 | 0.611 |
| 0.819000000000001 | 0.849 | 0.721 | 0.612 |
| 0.820000000000001 | 0.85 | 0.722 | 0.614 |
| 0.821000000000001 | 0.851 | 0.723 | 0.615 |
| 0.822000000000001 | 0.851 | 0.725 | 0.617 |
| 0.823000000000001 | 0.852 | 0.726 | 0.618 |
| 0.824000000000001 | 0.853 | 0.727 | 0.62 |
| 0.825000000000001 | 0.853 | 0.728 | 0.621 |
| 0.826000000000001 | 0.854 | 0.729 | 0.623 |
| 0.827000000000001 | 0.855 | 0.73 | 0.624 |
| 0.828000000000001 | 0.855 | 0.732 | 0.626 |
| 0.829000000000001 | 0.856 | 0.733 | 0.627 |
| 0.830000000000001 | 0.857 | 0.734 | 0.629 |
| 0.831000000000001 | 0.857 | 0.735 | 0.63 |
| 0.832000000000001 | 0.858 | 0.736 | 0.632 |
| 0.833000000000001 | 0.859 | 0.738 | 0.633 |
| 0.834000000000001 | 0.86 | 0.739 | 0.635 |
| 0.835000000000001 | 0.86 | 0.74 | 0.637 |
| 0.836000000000001 | 0.861 | 0.741 | 0.638 |
| 0.837000000000001 | 0.862 | 0.742 | 0.64 |
| 0.838000000000001 | 0.862 | 0.744 | 0.641 |
| 0.839000000000001 | 0.863 | 0.745 | 0.643 |
| 0.840000000000001 | 0.864 | 0.746 | 0.644 |
| 0.841000000000001 | 0.864 | 0.747 | 0.646 |
| 0.842000000000001 | 0.865 | 0.749 | 0.648 |
| 0.843000000000001 | 0.866 | 0.75 | 0.649 |
| 0.844000000000001 | 0.867 | 0.751 | 0.651 |
| 0.845000000000001 | 0.867 | 0.752 | 0.653 |
| 0.846000000000001 | 0.868 | 0.754 | 0.654 |
| 0.847000000000001 | 0.869 | 0.755 | 0.656 |
| 0.848000000000001 | 0.87 | 0.756 | 0.657 |
| 0.849000000000001 | 0.87 | 0.757 | 0.659 |
| 0.850000000000001 | 0.871 | 0.759 | 0.661 |
| 0.851000000000001 | 0.872 | 0.76 | 0.662 |
| 0.852000000000001 | 0.872 | 0.761 | 0.664 |
| 0.853000000000001 | 0.873 | 0.762 | 0.666 |
| 0.854000000000001 | 0.874 | 0.764 | 0.667 |
| 0.855000000000001 | 0.875 | 0.765 | 0.669 |
| 0.856000000000001 | 0.875 | 0.766 | 0.671 |
| 0.857000000000001 | 0.876 | 0.768 | 0.673 |
| 0.858000000000001 | 0.877 | 0.769 | 0.674 |
| 0.859000000000001 | 0.878 | 0.77 | 0.676 |
| 0.860000000000001 | 0.878 | 0.772 | 0.678 |
| 0.861000000000001 | 0.879 | 0.773 | 0.679 |
| 0.862000000000001 | 0.88 | 0.774 | 0.681 |
| 0.863000000000001 | 0.881 | 0.775 | 0.683 |
| 0.864000000000001 | 0.881 | 0.777 | 0.685 |
| 0.865000000000001 | 0.882 | 0.778 | 0.686 |
| 0.866000000000001 | 0.883 | 0.779 | 0.688 |
| 0.867000000000001 | 0.884 | 0.781 | 0.69 |
| 0.868000000000001 | 0.884 | 0.782 | 0.692 |
| 0.869000000000001 | 0.885 | 0.783 | 0.693 |
| 0.870000000000001 | 0.886 | 0.785 | 0.695 |
| 0.871000000000001 | 0.887 | 0.786 | 0.697 |
| 0.872000000000001 | 0.887 | 0.788 | 0.699 |
| 0.873000000000001 | 0.888 | 0.789 | 0.701 |
| 0.874000000000001 | 0.889 | 0.79 | 0.702 |
| 0.875000000000001 | 0.89 | 0.792 | 0.704 |
| 0.876000000000001 | 0.89 | 0.793 | 0.706 |
| 0.877000000000001 | 0.891 | 0.794 | 0.708 |
| 0.878000000000001 | 0.892 | 0.796 | 0.71 |
| 0.879000000000001 | 0.893 | 0.797 | 0.712 |
| 0.880000000000001 | 0.894 | 0.799 | 0.714 |
| 0.881000000000001 | 0.894 | 0.8 | 0.715 |
| 0.882000000000001 | 0.895 | 0.801 | 0.717 |
| 0.883000000000001 | 0.896 | 0.803 | 0.719 |
| 0.884000000000001 | 0.897 | 0.804 | 0.721 |
| 0.885000000000001 | 0.898 | 0.806 | 0.723 |
| 0.886000000000001 | 0.898 | 0.807 | 0.725 |
| 0.887000000000001 | 0.899 | 0.808 | 0.727 |
| 0.888000000000001 | 0.9 | 0.81 | 0.729 |
| 0.889000000000001 | 0.901 | 0.811 | 0.731 |
| 0.890000000000001 | 0.901 | 0.813 | 0.733 |
| 0.891000000000001 | 0.902 | 0.814 | 0.735 |
| 0.892000000000001 | 0.903 | 0.816 | 0.737 |
| 0.893000000000001 | 0.904 | 0.817 | 0.738 |
| 0.894000000000001 | 0.905 | 0.818 | 0.74 |
| 0.895000000000001 | 0.905 | 0.82 | 0.742 |
| 0.896000000000001 | 0.906 | 0.821 | 0.744 |
| 0.897000000000001 | 0.907 | 0.823 | 0.746 |
| 0.898000000000001 | 0.908 | 0.824 | 0.748 |
| 0.899000000000001 | 0.909 | 0.826 | 0.75 |
| 0.900000000000001 | 0.91 | 0.827 | 0.752 |
| 0.901000000000001 | 0.91 | 0.829 | 0.754 |
| 0.902000000000001 | 0.911 | 0.83 | 0.756 |
| 0.903000000000001 | 0.912 | 0.832 | 0.759 |
| 0.904000000000001 | 0.913 | 0.833 | 0.761 |
| 0.905000000000001 | 0.914 | 0.835 | 0.763 |
| 0.906000000000001 | 0.914 | 0.836 | 0.765 |
| 0.907000000000001 | 0.915 | 0.838 | 0.767 |
| 0.908000000000001 | 0.916 | 0.839 | 0.769 |
| 0.909000000000001 | 0.917 | 0.841 | 0.771 |
| 0.910000000000001 | 0.918 | 0.842 | 0.773 |
| 0.911000000000001 | 0.919 | 0.844 | 0.775 |
| 0.912000000000001 | 0.919 | 0.845 | 0.777 |
| 0.913000000000001 | 0.92 | 0.847 | 0.779 |
| 0.914000000000001 | 0.921 | 0.848 | 0.781 |
| 0.915000000000001 | 0.922 | 0.85 | 0.784 |
| 0.916000000000001 | 0.923 | 0.852 | 0.786 |
| 0.917000000000001 | 0.924 | 0.853 | 0.788 |
| 0.918000000000001 | 0.924 | 0.855 | 0.79 |
| 0.919000000000001 | 0.925 | 0.856 | 0.792 |
| 0.920000000000001 | 0.926 | 0.858 | 0.794 |
| 0.921000000000001 | 0.927 | 0.859 | 0.797 |
| 0.922000000000001 | 0.928 | 0.861 | 0.799 |
| 0.923000000000001 | 0.929 | 0.863 | 0.801 |
| 0.924000000000001 | 0.93 | 0.864 | 0.803 |
| 0.925000000000001 | 0.93 | 0.866 | 0.805 |
| 0.926000000000001 | 0.931 | 0.867 | 0.808 |
| 0.927000000000001 | 0.932 | 0.869 | 0.81 |
| 0.928000000000001 | 0.933 | 0.871 | 0.812 |
| 0.929000000000001 | 0.934 | 0.872 | 0.814 |
| 0.930000000000001 | 0.935 | 0.874 | 0.817 |
| 0.931000000000001 | 0.936 | 0.875 | 0.819 |
| 0.932000000000001 | 0.936 | 0.877 | 0.821 |
| 0.933000000000001 | 0.937 | 0.879 | 0.824 |
| 0.934000000000001 | 0.938 | 0.88 | 0.826 |
| 0.935000000000001 | 0.939 | 0.882 | 0.828 |
| 0.936000000000001 | 0.94 | 0.884 | 0.831 |
| 0.937000000000001 | 0.941 | 0.885 | 0.833 |
| 0.938000000000001 | 0.942 | 0.887 | 0.835 |
| 0.939000000000001 | 0.943 | 0.889 | 0.838 |
| 0.940000000000001 | 0.943 | 0.89 | 0.84 |
| 0.941000000000001 | 0.944 | 0.892 | 0.842 |
| 0.942000000000001 | 0.945 | 0.894 | 0.845 |
| 0.943000000000001 | 0.946 | 0.895 | 0.847 |
| 0.944000000000001 | 0.947 | 0.897 | 0.849 |
| 0.945000000000001 | 0.948 | 0.899 | 0.852 |
| 0.946000000000001 | 0.949 | 0.9 | 0.854 |
| 0.947000000000001 | 0.95 | 0.902 | 0.857 |
| 0.948000000000001 | 0.951 | 0.904 | 0.859 |
| 0.949000000000001 | 0.952 | 0.905 | 0.862 |
| 0.950000000000001 | 0.952 | 0.907 | 0.864 |
| 0.951000000000001 | 0.953 | 0.909 | 0.866 |
| 0.952000000000001 | 0.954 | 0.911 | 0.869 |
| 0.953000000000001 | 0.955 | 0.912 | 0.871 |
| 0.954000000000001 | 0.956 | 0.914 | 0.874 |
| 0.955000000000001 | 0.957 | 0.916 | 0.876 |
| 0.956000000000001 | 0.958 | 0.918 | 0.879 |
| 0.957000000000001 | 0.959 | 0.919 | 0.881 |
| 0.958000000000001 | 0.96 | 0.921 | 0.884 |
| 0.959000000000001 | 0.961 | 0.923 | 0.887 |
| 0.960000000000001 | 0.962 | 0.925 | 0.889 |
| 0.961000000000001 | 0.962 | 0.926 | 0.892 |
| 0.962000000000001 | 0.963 | 0.928 | 0.894 |
| 0.963000000000001 | 0.964 | 0.93 | 0.897 |
| 0.964000000000001 | 0.965 | 0.932 | 0.899 |
| 0.965000000000001 | 0.966 | 0.934 | 0.902 |
| 0.966000000000001 | 0.967 | 0.935 | 0.905 |
| 0.967000000000001 | 0.968 | 0.937 | 0.907 |
| 0.968000000000001 | 0.969 | 0.939 | 0.91 |
| 0.969000000000001 | 0.97 | 0.941 | 0.913 |
| 0.970000000000001 | 0.971 | 0.943 | 0.915 |
| 0.971000000000001 | 0.972 | 0.944 | 0.918 |
| 0.972000000000001 | 0.973 | 0.946 | 0.921 |
| 0.973000000000001 | 0.974 | 0.948 | 0.923 |
| 0.974000000000001 | 0.975 | 0.95 | 0.926 |
| 0.975000000000001 | 0.976 | 0.952 | 0.929 |
| 0.976000000000001 | 0.977 | 0.954 | 0.931 |
| 0.977000000000001 | 0.978 | 0.956 | 0.934 |
| 0.978000000000001 | 0.978 | 0.957 | 0.937 |
| 0.979000000000001 | 0.979 | 0.959 | 0.94 |
| 0.980000000000001 | 0.98 | 0.961 | 0.942 |
| 0.981000000000001 | 0.981 | 0.963 | 0.945 |
| 0.982000000000001 | 0.982 | 0.965 | 0.948 |
| 0.983000000000001 | 0.983 | 0.967 | 0.951 |
| 0.984000000000001 | 0.984 | 0.969 | 0.954 |
| 0.985000000000001 | 0.985 | 0.971 | 0.956 |
| 0.986000000000001 | 0.986 | 0.973 | 0.959 |
| 0.987000000000001 | 0.987 | 0.975 | 0.962 |
| 0.988000000000001 | 0.988 | 0.976 | 0.965 |
| 0.989000000000001 | 0.989 | 0.978 | 0.968 |
| 0.990000000000001 | 0.99 | 0.98 | 0.971 |
| 0.991000000000001 | 0.991 | 0.982 | 0.973 |
| 0.992000000000001 | 0.992 | 0.984 | 0.976 |
| 0.993000000000001 | 0.993 | 0.986 | 0.979 |
| 0.994000000000001 | 0.994 | 0.988 | 0.982 |
| 0.995000000000001 | 0.995 | 0.99 | 0.985 |
| 0.996000000000001 | 0.996 | 0.992 | 0.988 |
| 0.997000000000001 | 0.997 | 0.994 | 0.991 |
| 0.998000000000001 | 0.998 | 0.996 | 0.994 |
| 0.999000000000001 | 0.999 | 0.998 | 0.997 |
| 1.000000000000001 | 1 | 1 | 1 |
| 1.001000000000001 | 1.001 | 1.002 | 1.003 |
| 1.002 | 1.002 | 1.004 | 1.006 |
| 1.003 | 1.003 | 1.006 | 1.009 |
| 1.004 | 1.004 | 1.008 | 1.012 |
| 1.005 | 1.005 | 1.01 | 1.015 |
| 1.006 | 1.006 | 1.012 | 1.018 |
| 1.007 | 1.007 | 1.014 | 1.021 |
| 1.008 | 1.008 | 1.016 | 1.024 |
| 1.009 | 1.009 | 1.018 | 1.027 |
| 1.01 | 1.01 | 1.02 | 1.031 |
| 1.010999999999999 | 1.011 | 1.022 | 1.034 |
| 1.011999999999999 | 1.012 | 1.024 | 1.037 |
| 1.012999999999999 | 1.013 | 1.027 | 1.04 |
| 1.013999999999999 | 1.014 | 1.029 | 1.043 |
| 1.014999999999999 | 1.015 | 1.031 | 1.046 |
| 1.015999999999999 | 1.016 | 1.033 | 1.05 |
| 1.016999999999999 | 1.017 | 1.035 | 1.053 |
| 1.017999999999999 | 1.018 | 1.037 | 1.056 |
| 1.018999999999999 | 1.019 | 1.039 | 1.059 |
| 1.019999999999998 | 1.02 | 1.041 | 1.062 |
| 1.020999999999998 | 1.021 | 1.043 | 1.066 |
| 1.021999999999998 | 1.022 | 1.045 | 1.069 |
| 1.022999999999998 | 1.024 | 1.048 | 1.072 |
| 1.023999999999998 | 1.025 | 1.05 | 1.076 |
| 1.024999999999998 | 1.026 | 1.052 | 1.079 |
| 1.025999999999998 | 1.027 | 1.054 | 1.082 |
| 1.026999999999998 | 1.028 | 1.056 | 1.086 |
| 1.027999999999998 | 1.029 | 1.058 | 1.089 |
| 1.028999999999997 | 1.03 | 1.061 | 1.092 |
| 1.029999999999997 | 1.031 | 1.063 | 1.096 |
| 1.030999999999997 | 1.032 | 1.065 | 1.099 |
| 1.031999999999997 | 1.033 | 1.067 | 1.102 |
| 1.032999999999997 | 1.034 | 1.069 | 1.106 |
| 1.033999999999997 | 1.035 | 1.072 | 1.109 |
| 1.034999999999997 | 1.036 | 1.074 | 1.113 |
| 1.035999999999997 | 1.037 | 1.076 | 1.116 |
| 1.036999999999997 | 1.038 | 1.078 | 1.12 |
| 1.037999999999996 | 1.039 | 1.081 | 1.123 |
| 1.038999999999996 | 1.041 | 1.083 | 1.127 |
| 1.039999999999996 | 1.042 | 1.085 | 1.13 |
| 1.040999999999996 | 1.043 | 1.087 | 1.134 |
| 1.041999999999996 | 1.044 | 1.09 | 1.137 |
| 1.042999999999996 | 1.045 | 1.092 | 1.141 |
| 1.043999999999996 | 1.046 | 1.094 | 1.144 |
| 1.044999999999996 | 1.047 | 1.096 | 1.148 |
| 1.045999999999996 | 1.048 | 1.099 | 1.152 |
| 1.046999999999995 | 1.049 | 1.101 | 1.155 |
| 1.047999999999995 | 1.05 | 1.103 | 1.159 |
| 1.048999999999995 | 1.051 | 1.106 | 1.162 |
| 1.049999999999995 | 1.053 | 1.108 | 1.166 |
| 1.050999999999995 | 1.054 | 1.11 | 1.17 |
| 1.051999999999995 | 1.055 | 1.113 | 1.173 |
| 1.052999999999995 | 1.056 | 1.115 | 1.177 |
| 1.053999999999995 | 1.057 | 1.117 | 1.181 |
| 1.054999999999995 | 1.058 | 1.12 | 1.185 |
| 1.055999999999994 | 1.059 | 1.122 | 1.188 |
| 1.056999999999994 | 1.06 | 1.124 | 1.192 |
| 1.057999999999994 | 1.061 | 1.127 | 1.196 |
| 1.058999999999994 | 1.063 | 1.129 | 1.2 |
| 1.059999999999994 | 1.064 | 1.131 | 1.204 |
| 1.060999999999994 | 1.065 | 1.134 | 1.207 |
| 1.061999999999994 | 1.066 | 1.136 | 1.211 |
| 1.062999999999994 | 1.067 | 1.139 | 1.215 |
| 1.063999999999994 | 1.068 | 1.141 | 1.219 |
| 1.064999999999993 | 1.069 | 1.144 | 1.223 |
| 1.065999999999993 | 1.071 | 1.146 | 1.227 |
| 1.066999999999993 | 1.072 | 1.148 | 1.231 |
| 1.067999999999993 | 1.073 | 1.151 | 1.235 |
| 1.068999999999993 | 1.074 | 1.153 | 1.239 |
| 1.069999999999993 | 1.075 | 1.156 | 1.243 |
| 1.070999999999993 | 1.076 | 1.158 | 1.247 |
| 1.071999999999993 | 1.077 | 1.161 | 1.251 |
| 1.072999999999993 | 1.079 | 1.163 | 1.255 |
| 1.073999999999993 | 1.08 | 1.166 | 1.259 |
| 1.074999999999992 | 1.081 | 1.168 | 1.263 |
| 1.075999999999992 | 1.082 | 1.171 | 1.267 |
| 1.076999999999992 | 1.083 | 1.173 | 1.271 |
| 1.077999999999992 | 1.084 | 1.176 | 1.275 |
| 1.078999999999992 | 1.086 | 1.178 | 1.279 |
| 1.079999999999992 | 1.087 | 1.181 | 1.283 |
| 1.080999999999992 | 1.088 | 1.183 | 1.287 |
| 1.081999999999992 | 1.089 | 1.186 | 1.292 |
| 1.082999999999992 | 1.09 | 1.189 | 1.296 |
| 1.083999999999991 | 1.091 | 1.191 | 1.3 |
| 1.084999999999991 | 1.093 | 1.194 | 1.304 |
| 1.085999999999991 | 1.094 | 1.196 | 1.308 |
| 1.086999999999991 | 1.095 | 1.199 | 1.313 |
| 1.087999999999991 | 1.096 | 1.201 | 1.317 |
| 1.088999999999991 | 1.097 | 1.204 | 1.321 |
| 1.089999999999991 | 1.098 | 1.207 | 1.326 |
| 1.090999999999991 | 1.1 | 1.209 | 1.33 |
| 1.091999999999991 | 1.101 | 1.212 | 1.334 |
| 1.09299999999999 | 1.102 | 1.215 | 1.339 |
| 1.09399999999999 | 1.103 | 1.217 | 1.343 |
| 1.09499999999999 | 1.104 | 1.22 | 1.347 |
| 1.09599999999999 | 1.106 | 1.223 | 1.352 |
| 1.09699999999999 | 1.107 | 1.225 | 1.356 |
| 1.09799999999999 | 1.108 | 1.228 | 1.361 |
| 1.09899999999999 | 1.109 | 1.231 | 1.365 |
| 1.09999999999999 | 1.111 | 1.233 | 1.37 |
| 1.10099999999999 | 1.112 | 1.236 | 1.374 |
| 1.101999999999989 | 1.113 | 1.239 | 1.379 |
| 1.102999999999989 | 1.114 | 1.241 | 1.383 |
| 1.103999999999989 | 1.115 | 1.244 | 1.388 |
| 1.104999999999989 | 1.117 | 1.247 | 1.392 |
| 1.105999999999989 | 1.118 | 1.25 | 1.397 |
| 1.106999999999989 | 1.119 | 1.252 | 1.402 |
| 1.107999999999989 | 1.12 | 1.255 | 1.406 |
| 1.108999999999989 | 1.122 | 1.258 | 1.411 |
| 1.109999999999989 | 1.123 | 1.261 | 1.416 |
| 1.110999999999988 | 1.124 | 1.264 | 1.42 |
| 1.111999999999988 | 1.125 | 1.266 | 1.425 |
| 1.112999999999988 | 1.127 | 1.269 | 1.43 |
| 1.113999999999988 | 1.128 | 1.272 | 1.434 |
| 1.114999999999988 | 1.129 | 1.275 | 1.439 |
| 1.115999999999988 | 1.13 | 1.278 | 1.444 |
| 1.116999999999988 | 1.132 | 1.28 | 1.449 |
| 1.117999999999988 | 1.133 | 1.283 | 1.454 |
| 1.118999999999988 | 1.134 | 1.286 | 1.459 |
| 1.119999999999987 | 1.135 | 1.289 | 1.463 |
| 1.120999999999987 | 1.137 | 1.292 | 1.468 |
| 1.121999999999987 | 1.138 | 1.295 | 1.473 |
| 1.122999999999987 | 1.139 | 1.298 | 1.478 |
| 1.123999999999987 | 1.14 | 1.301 | 1.483 |
| 1.124999999999987 | 1.142 | 1.303 | 1.488 |
| 1.125999999999987 | 1.143 | 1.306 | 1.493 |
| 1.126999999999987 | 1.144 | 1.309 | 1.498 |
| 1.127999999999987 | 1.146 | 1.312 | 1.503 |
| 1.128999999999986 | 1.147 | 1.315 | 1.508 |
| 1.129999999999986 | 1.148 | 1.318 | 1.513 |
| 1.130999999999986 | 1.149 | 1.321 | 1.518 |
| 1.131999999999986 | 1.151 | 1.324 | 1.524 |
| 1.132999999999986 | 1.152 | 1.327 | 1.529 |
| 1.133999999999986 | 1.153 | 1.33 | 1.534 |
| 1.134999999999986 | 1.155 | 1.333 | 1.539 |
| 1.135999999999986 | 1.156 | 1.336 | 1.544 |
| 1.136999999999986 | 1.157 | 1.339 | 1.55 |
| 1.137999999999985 | 1.158 | 1.342 | 1.555 |
| 1.138999999999985 | 1.16 | 1.345 | 1.56 |
| 1.139999999999985 | 1.161 | 1.348 | 1.565 |
| 1.140999999999985 | 1.162 | 1.351 | 1.571 |
| 1.141999999999985 | 1.164 | 1.354 | 1.576 |
| 1.142999999999985 | 1.165 | 1.357 | 1.581 |
| 1.143999999999985 | 1.166 | 1.36 | 1.587 |
| 1.144999999999985 | 1.168 | 1.364 | 1.592 |
| 1.145999999999985 | 1.169 | 1.367 | 1.598 |
| 1.146999999999984 | 1.17 | 1.37 | 1.603 |
| 1.147999999999984 | 1.172 | 1.373 | 1.609 |
| 1.148999999999984 | 1.173 | 1.376 | 1.614 |
| 1.149999999999984 | 1.174 | 1.379 | 1.62 |
| 1.150999999999984 | 1.176 | 1.382 | 1.625 |
| 1.151999999999984 | 1.177 | 1.385 | 1.631 |
| 1.152999999999984 | 1.178 | 1.389 | 1.636 |
| 1.153999999999984 | 1.18 | 1.392 | 1.642 |
| 1.154999999999984 | 1.181 | 1.395 | 1.648 |
| 1.155999999999983 | 1.182 | 1.398 | 1.653 |
| 1.156999999999983 | 1.184 | 1.401 | 1.659 |
| 1.157999999999983 | 1.185 | 1.405 | 1.665 |
| 1.158999999999983 | 1.187 | 1.408 | 1.67 |
| 1.159999999999983 | 1.188 | 1.411 | 1.676 |
| 1.160999999999983 | 1.189 | 1.414 | 1.682 |
| 1.161999999999983 | 1.191 | 1.418 | 1.688 |
| 1.162999999999983 | 1.192 | 1.421 | 1.694 |
| 1.163999999999983 | 1.193 | 1.424 | 1.699 |
| 1.164999999999982 | 1.195 | 1.427 | 1.705 |
| 1.165999999999982 | 1.196 | 1.431 | 1.711 |
| 1.166999999999982 | 1.197 | 1.434 | 1.717 |
| 1.167999999999982 | 1.199 | 1.437 | 1.723 |
| 1.168999999999982 | 1.2 | 1.441 | 1.729 |
| 1.169999999999982 | 1.202 | 1.444 | 1.735 |
| 1.170999999999982 | 1.203 | 1.447 | 1.741 |
| 1.171999999999982 | 1.204 | 1.451 | 1.747 |
| 1.172999999999982 | 1.206 | 1.454 | 1.753 |
| 1.173999999999981 | 1.207 | 1.457 | 1.759 |
| 1.174999999999981 | 1.209 | 1.461 | 1.766 |
| 1.175999999999981 | 1.21 | 1.464 | 1.772 |
| 1.176999999999981 | 1.211 | 1.468 | 1.778 |
| 1.177999999999981 | 1.213 | 1.471 | 1.784 |
| 1.178999999999981 | 1.214 | 1.474 | 1.79 |
| 1.179999999999981 | 1.216 | 1.478 | 1.797 |
| 1.180999999999981 | 1.217 | 1.481 | 1.803 |
| 1.181999999999981 | 1.219 | 1.485 | 1.809 |
| 1.18299999999998 | 1.22 | 1.488 | 1.816 |
| 1.18399999999998 | 1.221 | 1.492 | 1.822 |
| 1.18499999999998 | 1.223 | 1.495 | 1.828 |
| 1.18599999999998 | 1.224 | 1.499 | 1.835 |
| 1.18699999999998 | 1.226 | 1.502 | 1.841 |
| 1.18799999999998 | 1.227 | 1.506 | 1.848 |
| 1.18899999999998 | 1.229 | 1.509 | 1.854 |
| 1.18999999999998 | 1.23 | 1.513 | 1.861 |
| 1.19099999999998 | 1.231 | 1.516 | 1.867 |
| 1.191999999999979 | 1.233 | 1.52 | 1.874 |
| 1.192999999999979 | 1.234 | 1.524 | 1.881 |
| 1.193999999999979 | 1.236 | 1.527 | 1.887 |
| 1.194999999999979 | 1.237 | 1.531 | 1.894 |
| 1.195999999999979 | 1.239 | 1.534 | 1.901 |
| 1.196999999999979 | 1.24 | 1.538 | 1.907 |
| 1.197999999999979 | 1.242 | 1.542 | 1.914 |
| 1.198999999999979 | 1.243 | 1.545 | 1.921 |
| 1.199999999999979 | 1.245 | 1.549 | 1.928 |
| 1.200999999999979 | 1.246 | 1.553 | 1.935 |
| 1.201999999999978 | 1.248 | 1.556 | 1.941 |
| 1.202999999999978 | 1.249 | 1.56 | 1.948 |
| 1.203999999999978 | 1.25 | 1.564 | 1.955 |
| 1.204999999999978 | 1.252 | 1.567 | 1.962 |
| 1.205999999999978 | 1.253 | 1.571 | 1.969 |
| 1.206999999999978 | 1.255 | 1.575 | 1.976 |
| 1.207999999999978 | 1.256 | 1.579 | 1.983 |
| 1.208999999999978 | 1.258 | 1.582 | 1.99 |
| 1.209999999999978 | 1.259 | 1.586 | 1.998 |
| 1.210999999999977 | 1.261 | 1.59 | 2.005 |
| 1.211999999999977 | 1.262 | 1.594 | 2.012 |
| 1.212999999999977 | 1.264 | 1.598 | 2.019 |
| 1.213999999999977 | 1.265 | 1.601 | 2.026 |
| 1.214999999999977 | 1.267 | 1.605 | 2.034 |
| 1.215999999999977 | 1.268 | 1.609 | 2.041 |
| 1.216999999999977 | 1.27 | 1.613 | 2.048 |
| 1.217999999999977 | 1.272 | 1.617 | 2.056 |
| 1.218999999999977 | 1.273 | 1.621 | 2.063 |
| 1.219999999999976 | 1.275 | 1.624 | 2.071 |
| 1.220999999999976 | 1.276 | 1.628 | 2.078 |
| 1.221999999999976 | 1.278 | 1.632 | 2.085 |
| 1.222999999999976 | 1.279 | 1.636 | 2.093 |
| 1.223999999999976 | 1.281 | 1.64 | 2.101 |
| 1.224999999999976 | 1.282 | 1.644 | 2.108 |
| 1.225999999999976 | 1.284 | 1.648 | 2.116 |
| 1.226999999999976 | 1.285 | 1.652 | 2.123 |
| 1.227999999999976 | 1.287 | 1.656 | 2.131 |
| 1.228999999999975 | 1.288 | 1.66 | 2.139 |
| 1.229999999999975 | 1.29 | 1.664 | 2.147 |
| 1.230999999999975 | 1.292 | 1.668 | 2.154 |
| 1.231999999999975 | 1.293 | 1.672 | 2.162 |
| 1.232999999999975 | 1.295 | 1.676 | 2.17 |
| 1.233999999999975 | 1.296 | 1.68 | 2.178 |
| 1.234999999999975 | 1.298 | 1.684 | 2.186 |
| 1.235999999999975 | 1.299 | 1.688 | 2.194 |
| 1.236999999999975 | 1.301 | 1.692 | 2.202 |
| 1.237999999999974 | 1.303 | 1.697 | 2.21 |
| 1.238999999999974 | 1.304 | 1.701 | 2.218 |
| 1.239999999999974 | 1.306 | 1.705 | 2.226 |
| 1.240999999999974 | 1.307 | 1.709 | 2.234 |
| 1.241999999999974 | 1.309 | 1.713 | 2.242 |
| 1.242999999999974 | 1.31 | 1.717 | 2.251 |
| 1.243999999999974 | 1.312 | 1.722 | 2.259 |
| 1.244999999999974 | 1.314 | 1.726 | 2.267 |
| 1.245999999999974 | 1.315 | 1.73 | 2.275 |
| 1.246999999999973 | 1.317 | 1.734 | 2.284 |
| 1.247999999999973 | 1.318 | 1.738 | 2.292 |
| 1.248999999999973 | 1.32 | 1.743 | 2.3 |
| 1.249999999999973 | 1.322 | 1.747 | 2.309 |
| 1.250999999999973 | 1.323 | 1.751 | 2.317 |
| 1.251999999999973 | 1.325 | 1.756 | 2.326 |
| 1.252999999999973 | 1.327 | 1.76 | 2.335 |
| 1.253999999999973 | 1.328 | 1.764 | 2.343 |
| 1.254999999999973 | 1.33 | 1.768 | 2.352 |
| 1.255999999999972 | 1.331 | 1.773 | 2.36 |
| 1.256999999999972 | 1.333 | 1.777 | 2.369 |
| 1.257999999999972 | 1.335 | 1.782 | 2.378 |
| 1.258999999999972 | 1.336 | 1.786 | 2.387 |
| 1.259999999999972 | 1.338 | 1.79 | 2.396 |
| 1.260999999999972 | 1.34 | 1.795 | 2.404 |
| 1.261999999999972 | 1.341 | 1.799 | 2.413 |
| 1.262999999999972 | 1.343 | 1.804 | 2.422 |
| 1.263999999999972 | 1.345 | 1.808 | 2.431 |
| 1.264999999999971 | 1.346 | 1.813 | 2.44 |
| 1.265999999999971 | 1.348 | 1.817 | 2.449 |
| 1.266999999999971 | 1.35 | 1.822 | 2.458 |
| 1.267999999999971 | 1.351 | 1.826 | 2.468 |
| 1.268999999999971 | 1.353 | 1.831 | 2.477 |
| 1.269999999999971 | 1.355 | 1.835 | 2.486 |
| 1.270999999999971 | 1.356 | 1.84 | 2.495 |
| 1.271999999999971 | 1.358 | 1.844 | 2.505 |
| 1.272999999999971 | 1.36 | 1.849 | 2.514 |
| 1.27399999999997 | 1.361 | 1.853 | 2.523 |
| 1.27499999999997 | 1.363 | 1.858 | 2.533 |
| 1.27599999999997 | 1.365 | 1.863 | 2.542 |
| 1.27699999999997 | 1.366 | 1.867 | 2.552 |
| 1.27799999999997 | 1.368 | 1.872 | 2.561 |
| 1.27899999999997 | 1.37 | 1.877 | 2.571 |
| 1.27999999999997 | 1.372 | 1.881 | 2.58 |
| 1.28099999999997 | 1.373 | 1.886 | 2.59 |
| 1.28199999999997 | 1.375 | 1.891 | 2.6 |
| 1.282999999999969 | 1.377 | 1.895 | 2.61 |
| 1.283999999999969 | 1.378 | 1.9 | 2.619 |
| 1.284999999999969 | 1.38 | 1.905 | 2.629 |
| 1.285999999999969 | 1.382 | 1.91 | 2.639 |
| 1.286999999999969 | 1.384 | 1.914 | 2.649 |
| 1.287999999999969 | 1.385 | 1.919 | 2.659 |
| 1.288999999999969 | 1.387 | 1.924 | 2.669 |
| 1.289999999999969 | 1.389 | 1.929 | 2.679 |
| 1.290999999999969 | 1.391 | 1.934 | 2.689 |
| 1.291999999999968 | 1.392 | 1.939 | 2.699 |
| 1.292999999999968 | 1.394 | 1.944 | 2.71 |
| 1.293999999999968 | 1.396 | 1.948 | 2.72 |
| 1.294999999999968 | 1.398 | 1.953 | 2.73 |
| 1.295999999999968 | 1.399 | 1.958 | 2.74 |
| 1.296999999999968 | 1.401 | 1.963 | 2.751 |
| 1.297999999999968 | 1.403 | 1.968 | 2.761 |
| 1.298999999999968 | 1.405 | 1.973 | 2.772 |
| 1.299999999999968 | 1.406 | 1.978 | 2.782 |
| 1.300999999999967 | 1.408 | 1.983 | 2.793 |
| 1.301999999999967 | 1.41 | 1.988 | 2.803 |
| 1.302999999999967 | 1.412 | 1.993 | 2.814 |
| 1.303999999999967 | 1.414 | 1.998 | 2.825 |
| 1.304999999999967 | 1.415 | 2.003 | 2.835 |
| 1.305999999999967 | 1.417 | 2.008 | 2.846 |
| 1.306999999999967 | 1.419 | 2.013 | 2.857 |
| 1.307999999999967 | 1.421 | 2.019 | 2.868 |
| 1.308999999999967 | 1.423 | 2.024 | 2.879 |
| 1.309999999999966 | 1.424 | 2.029 | 2.89 |
| 1.310999999999966 | 1.426 | 2.034 | 2.901 |
| 1.311999999999966 | 1.428 | 2.039 | 2.912 |
| 1.312999999999966 | 1.43 | 2.044 | 2.923 |
| 1.313999999999966 | 1.432 | 2.05 | 2.934 |
| 1.314999999999966 | 1.433 | 2.055 | 2.946 |
| 1.315999999999966 | 1.435 | 2.06 | 2.957 |
| 1.316999999999966 | 1.437 | 2.065 | 2.968 |
| 1.317999999999966 | 1.439 | 2.071 | 2.98 |
| 1.318999999999965 | 1.441 | 2.076 | 2.991 |
| 1.319999999999965 | 1.443 | 2.081 | 3.002 |
| 1.320999999999965 | 1.444 | 2.087 | 3.014 |
| 1.321999999999965 | 1.446 | 2.092 | 3.026 |
| 1.322999999999965 | 1.448 | 2.097 | 3.037 |
| 1.323999999999965 | 1.45 | 2.103 | 3.049 |
| 1.324999999999965 | 1.452 | 2.108 | 3.061 |
| 1.325999999999965 | 1.454 | 2.113 | 3.072 |
| 1.326999999999965 | 1.456 | 2.119 | 3.084 |
| 1.327999999999964 | 1.457 | 2.124 | 3.096 |
| 1.328999999999964 | 1.459 | 2.13 | 3.108 |
| 1.329999999999964 | 1.461 | 2.135 | 3.12 |
| 1.330999999999964 | 1.463 | 2.141 | 3.132 |
| 1.331999999999964 | 1.465 | 2.146 | 3.144 |
| 1.332999999999964 | 1.467 | 2.152 | 3.156 |
| 1.333999999999964 | 1.469 | 2.157 | 3.169 |
| 1.334999999999964 | 1.471 | 2.163 | 3.181 |
| 1.335999999999964 | 1.473 | 2.168 | 3.193 |
| 1.336999999999963 | 1.474 | 2.174 | 3.206 |
| 1.337999999999963 | 1.476 | 2.18 | 3.218 |
| 1.338999999999963 | 1.478 | 2.185 | 3.231 |
| 1.339999999999963 | 1.48 | 2.191 | 3.243 |
| 1.340999999999963 | 1.482 | 2.197 | 3.256 |
| 1.341999999999963 | 1.484 | 2.202 | 3.268 |
| 1.342999999999963 | 1.486 | 2.208 | 3.281 |
| 1.343999999999963 | 1.488 | 2.214 | 3.294 |
| 1.344999999999963 | 1.49 | 2.22 | 3.307 |
| 1.345999999999963 | 1.492 | 2.225 | 3.32 |
| 1.346999999999962 | 1.494 | 2.231 | 3.333 |
| 1.347999999999962 | 1.496 | 2.237 | 3.346 |
| 1.348999999999962 | 1.498 | 2.243 | 3.359 |
| 1.349999999999962 | 1.5 | 2.249 | 3.372 |
| 1.350999999999962 | 1.501 | 2.254 | 3.385 |
| 1.351999999999962 | 1.503 | 2.26 | 3.398 |
| 1.352999999999962 | 1.505 | 2.266 | 3.411 |
| 1.353999999999962 | 1.507 | 2.272 | 3.425 |
| 1.354999999999962 | 1.509 | 2.278 | 3.438 |
| 1.355999999999961 | 1.511 | 2.284 | 3.452 |
| 1.356999999999961 | 1.513 | 2.29 | 3.465 |
| 1.357999999999961 | 1.515 | 2.296 | 3.479 |
| 1.358999999999961 | 1.517 | 2.302 | 3.492 |
| 1.359999999999961 | 1.519 | 2.308 | 3.506 |
| 1.360999999999961 | 1.521 | 2.314 | 3.52 |
| 1.361999999999961 | 1.523 | 2.32 | 3.534 |
| 1.362999999999961 | 1.525 | 2.326 | 3.548 |
| 1.363999999999961 | 1.527 | 2.332 | 3.562 |
| 1.36499999999996 | 1.529 | 2.338 | 3.576 |
| 1.36599999999996 | 1.531 | 2.345 | 3.59 |
| 1.36699999999996 | 1.533 | 2.351 | 3.604 |
| 1.36799999999996 | 1.535 | 2.357 | 3.618 |
| 1.36899999999996 | 1.537 | 2.363 | 3.633 |
| 1.36999999999996 | 1.539 | 2.369 | 3.647 |
| 1.37099999999996 | 1.541 | 2.376 | 3.661 |
| 1.37199999999996 | 1.543 | 2.382 | 3.676 |
| 1.37299999999996 | 1.545 | 2.388 | 3.69 |
| 1.373999999999959 | 1.547 | 2.394 | 3.705 |
| 1.374999999999959 | 1.549 | 2.401 | 3.72 |
| 1.375999999999959 | 1.551 | 2.407 | 3.734 |
| 1.376999999999959 | 1.554 | 2.413 | 3.749 |
| 1.377999999999959 | 1.556 | 2.42 | 3.764 |
| 1.378999999999959 | 1.558 | 2.426 | 3.779 |
| 1.379999999999959 | 1.56 | 2.433 | 3.794 |
| 1.380999999999959 | 1.562 | 2.439 | 3.809 |
| 1.381999999999959 | 1.564 | 2.445 | 3.824 |
| 1.382999999999958 | 1.566 | 2.452 | 3.839 |
| 1.383999999999958 | 1.568 | 2.458 | 3.855 |
| 1.384999999999958 | 1.57 | 2.465 | 3.87 |
| 1.385999999999958 | 1.572 | 2.472 | 3.886 |
| 1.386999999999958 | 1.574 | 2.478 | 3.901 |
| 1.387999999999958 | 1.576 | 2.485 | 3.917 |
| 1.388999999999958 | 1.578 | 2.491 | 3.932 |
| 1.389999999999958 | 1.58 | 2.498 | 3.948 |
| 1.390999999999958 | 1.583 | 2.505 | 3.964 |
| 1.391999999999957 | 1.585 | 2.511 | 3.98 |
| 1.392999999999957 | 1.587 | 2.518 | 3.996 |
| 1.393999999999957 | 1.589 | 2.525 | 4.012 |
| 1.394999999999957 | 1.591 | 2.531 | 4.028 |
| 1.395999999999957 | 1.593 | 2.538 | 4.044 |
| 1.396999999999957 | 1.595 | 2.545 | 4.06 |
| 1.397999999999957 | 1.597 | 2.552 | 4.076 |
| 1.398999999999957 | 1.6 | 2.559 | 4.093 |
| 1.399999999999957 | 1.602 | 2.565 | 4.109 |
| 1.400999999999956 | 1.604 | 2.572 | 4.126 |
| 1.401999999999956 | 1.606 | 2.579 | 4.142 |
| 1.402999999999956 | 1.608 | 2.586 | 4.159 |
| 1.403999999999956 | 1.61 | 2.593 | 4.176 |
| 1.404999999999956 | 1.612 | 2.6 | 4.192 |
| 1.405999999999956 | 1.615 | 2.607 | 4.209 |
| 1.406999999999956 | 1.617 | 2.614 | 4.226 |
| 1.407999999999956 | 1.619 | 2.621 | 4.243 |
| 1.408999999999956 | 1.621 | 2.628 | 4.26 |
| 1.409999999999955 | 1.623 | 2.635 | 4.278 |
| 1.410999999999955 | 1.625 | 2.642 | 4.295 |
| 1.411999999999955 | 1.628 | 2.649 | 4.312 |
| 1.412999999999955 | 1.63 | 2.656 | 4.33 |
| 1.413999999999955 | 1.632 | 2.664 | 4.347 |
| 1.414999999999955 | 1.634 | 2.671 | 4.365 |
| 1.415999999999955 | 1.636 | 2.678 | 4.382 |
| 1.416999999999955 | 1.639 | 2.685 | 4.4 |
| 1.417999999999955 | 1.641 | 2.692 | 4.418 |
| 1.418999999999954 | 1.643 | 2.7 | 4.436 |
| 1.419999999999954 | 1.645 | 2.707 | 4.454 |
| 1.420999999999954 | 1.648 | 2.714 | 4.472 |
| 1.421999999999954 | 1.65 | 2.722 | 4.49 |
| 1.422999999999954 | 1.652 | 2.729 | 4.508 |
| 1.423999999999954 | 1.654 | 2.737 | 4.527 |
| 1.424999999999954 | 1.656 | 2.744 | 4.545 |
| 1.425999999999954 | 1.659 | 2.751 | 4.564 |
| 1.426999999999954 | 1.661 | 2.759 | 4.582 |
| 1.427999999999954 | 1.663 | 2.766 | 4.601 |
| 1.428999999999953 | 1.665 | 2.774 | 4.62 |
| 1.429999999999953 | 1.668 | 2.781 | 4.639 |
| 1.430999999999953 | 1.67 | 2.789 | 4.658 |
| 1.431999999999953 | 1.672 | 2.797 | 4.677 |
| 1.432999999999953 | 1.675 | 2.804 | 4.696 |
| 1.433999999999953 | 1.677 | 2.812 | 4.715 |
| 1.434999999999953 | 1.679 | 2.819 | 4.734 |
| 1.435999999999953 | 1.681 | 2.827 | 4.754 |
| 1.436999999999953 | 1.684 | 2.835 | 4.773 |
| 1.437999999999952 | 1.686 | 2.843 | 4.793 |
| 1.438999999999952 | 1.688 | 2.85 | 4.812 |
| 1.439999999999952 | 1.691 | 2.858 | 4.832 |
| 1.440999999999952 | 1.693 | 2.866 | 4.852 |
| 1.441999999999952 | 1.695 | 2.874 | 4.872 |
| 1.442999999999952 | 1.698 | 2.882 | 4.892 |
| 1.443999999999952 | 1.7 | 2.89 | 4.912 |
| 1.444999999999952 | 1.702 | 2.897 | 4.932 |
| 1.445999999999952 | 1.705 | 2.905 | 4.952 |
| 1.446999999999951 | 1.707 | 2.913 | 4.973 |
| 1.447999999999951 | 1.709 | 2.921 | 4.993 |
| 1.448999999999951 | 1.712 | 2.929 | 5.014 |
| 1.449999999999951 | 1.714 | 2.937 | 5.034 |
| 1.450999999999951 | 1.716 | 2.945 | 5.055 |
| 1.451999999999951 | 1.719 | 2.954 | 5.076 |
| 1.452999999999951 | 1.721 | 2.962 | 5.097 |
| 1.453999999999951 | 1.723 | 2.97 | 5.118 |
| 1.454999999999951 | 1.726 | 2.978 | 5.139 |
| 1.45599999999995 | 1.728 | 2.986 | 5.16 |
| 1.45699999999995 | 1.73 | 2.994 | 5.182 |
| 1.45799999999995 | 1.733 | 3.003 | 5.203 |
| 1.45899999999995 | 1.735 | 3.011 | 5.225 |
| 1.45999999999995 | 1.738 | 3.019 | 5.246 |
| 1.46099999999995 | 1.74 | 3.028 | 5.268 |
| 1.46199999999995 | 1.742 | 3.036 | 5.29 |
| 1.46299999999995 | 1.745 | 3.044 | 5.312 |
| 1.46399999999995 | 1.747 | 3.053 | 5.334 |
| 1.464999999999949 | 1.75 | 3.061 | 5.356 |
| 1.465999999999949 | 1.752 | 3.07 | 5.378 |
| 1.466999999999949 | 1.754 | 3.078 | 5.401 |
| 1.467999999999949 | 1.757 | 3.087 | 5.423 |
| 1.468999999999949 | 1.759 | 3.095 | 5.446 |
| 1.469999999999949 | 1.762 | 3.104 | 5.469 |
| 1.470999999999949 | 1.764 | 3.113 | 5.491 |
| 1.471999999999949 | 1.767 | 3.121 | 5.514 |
| 1.472999999999949 | 1.769 | 3.13 | 5.537 |
| 1.473999999999948 | 1.772 | 3.139 | 5.56 |
| 1.474999999999948 | 1.774 | 3.147 | 5.583 |
| 1.475999999999948 | 1.777 | 3.156 | 5.607 |
| 1.476999999999948 | 1.779 | 3.165 | 5.63 |
| 1.477999999999948 | 1.781 | 3.174 | 5.654 |
| 1.478999999999948 | 1.784 | 3.182 | 5.677 |
| 1.479999999999948 | 1.786 | 3.191 | 5.701 |
| 1.480999999999948 | 1.789 | 3.2 | 5.725 |
| 1.481999999999948 | 1.791 | 3.209 | 5.749 |
| 1.482999999999947 | 1.794 | 3.218 | 5.773 |
| 1.483999999999947 | 1.796 | 3.227 | 5.797 |
| 1.484999999999947 | 1.799 | 3.236 | 5.822 |
| 1.485999999999947 | 1.801 | 3.245 | 5.846 |
| 1.486999999999947 | 1.804 | 3.254 | 5.871 |
| 1.487999999999947 | 1.806 | 3.263 | 5.895 |
| 1.488999999999947 | 1.809 | 3.273 | 5.92 |
| 1.489999999999947 | 1.812 | 3.282 | 5.945 |
| 1.490999999999947 | 1.814 | 3.291 | 5.97 |
| 1.491999999999946 | 1.817 | 3.3 | 5.995 |
| 1.492999999999946 | 1.819 | 3.309 | 6.02 |
| 1.493999999999946 | 1.822 | 3.319 | 6.046 |
| 1.494999999999946 | 1.824 | 3.328 | 6.071 |
| 1.495999999999946 | 1.827 | 3.337 | 6.097 |
| 1.496999999999946 | 1.829 | 3.347 | 6.122 |
| 1.497999999999946 | 1.832 | 3.356 | 6.148 |
| 1.498999999999946 | 1.835 | 3.366 | 6.174 |
| 1.499999999999946 | 1.837 | 3.375 | 6.2 |
| 1.500999999999945 | 1.84 | 3.385 | 6.226 |
| 1.501999999999945 | 1.842 | 3.394 | 6.253 |
| 1.502999999999945 | 1.845 | 3.404 | 6.279 |
| 1.503999999999945 | 1.847 | 3.413 | 6.306 |
| 1.504999999999945 | 1.85 | 3.423 | 6.333 |
| 1.505999999999945 | 1.853 | 3.432 | 6.359 |
| 1.506999999999945 | 1.855 | 3.442 | 6.386 |
| 1.507999999999945 | 1.858 | 3.452 | 6.413 |
| 1.508999999999945 | 1.861 | 3.462 | 6.441 |
| 1.509999999999944 | 1.863 | 3.471 | 6.468 |
| 1.510999999999944 | 1.866 | 3.481 | 6.495 |
| 1.511999999999944 | 1.868 | 3.491 | 6.523 |
| 1.512999999999944 | 1.871 | 3.501 | 6.551 |
| 1.513999999999944 | 1.874 | 3.511 | 6.579 |
| 1.514999999999944 | 1.876 | 3.521 | 6.607 |
| 1.515999999999944 | 1.879 | 3.531 | 6.635 |
| 1.516999999999944 | 1.882 | 3.541 | 6.663 |
| 1.517999999999944 | 1.884 | 3.551 | 6.691 |
| 1.518999999999944 | 1.887 | 3.561 | 6.72 |
| 1.519999999999943 | 1.89 | 3.571 | 6.748 |
| 1.520999999999943 | 1.892 | 3.581 | 6.777 |
| 1.521999999999943 | 1.895 | 3.591 | 6.806 |
| 1.522999999999943 | 1.898 | 3.602 | 6.835 |
| 1.523999999999943 | 1.901 | 3.612 | 6.864 |
| 1.524999999999943 | 1.903 | 3.622 | 6.894 |
| 1.525999999999943 | 1.906 | 3.633 | 6.923 |
| 1.526999999999943 | 1.909 | 3.643 | 6.953 |
| 1.527999999999943 | 1.911 | 3.653 | 6.983 |
| 1.528999999999942 | 1.914 | 3.664 | 7.013 |
| 1.529999999999942 | 1.917 | 3.674 | 7.043 |
| 1.530999999999942 | 1.92 | 3.685 | 7.073 |
| 1.531999999999942 | 1.922 | 3.695 | 7.103 |
| 1.532999999999942 | 1.925 | 3.706 | 7.134 |
| 1.533999999999942 | 1.928 | 3.716 | 7.164 |
| 1.534999999999942 | 1.931 | 3.727 | 7.195 |
| 1.535999999999942 | 1.933 | 3.738 | 7.226 |
| 1.536999999999942 | 1.936 | 3.748 | 7.257 |
| 1.537999999999941 | 1.939 | 3.759 | 7.288 |
| 1.538999999999941 | 1.942 | 3.77 | 7.319 |
| 1.539999999999941 | 1.944 | 3.781 | 7.351 |
| 1.540999999999941 | 1.947 | 3.791 | 7.383 |
| 1.541999999999941 | 1.95 | 3.802 | 7.414 |
| 1.542999999999941 | 1.953 | 3.813 | 7.446 |
| 1.543999999999941 | 1.956 | 3.824 | 7.478 |
| 1.544999999999941 | 1.958 | 3.835 | 7.511 |
| 1.545999999999941 | 1.961 | 3.846 | 7.543 |
| 1.54699999999994 | 1.964 | 3.857 | 7.576 |
| 1.54799999999994 | 1.967 | 3.868 | 7.608 |
| 1.54899999999994 | 1.97 | 3.88 | 7.641 |
| 1.54999999999994 | 1.972 | 3.891 | 7.674 |
| 1.55099999999994 | 1.975 | 3.902 | 7.708 |
| 1.55199999999994 | 1.978 | 3.913 | 7.741 |
| 1.55299999999994 | 1.981 | 3.924 | 7.774 |
| 1.55399999999994 | 1.984 | 3.936 | 7.808 |
| 1.55499999999994 | 1.987 | 3.947 | 7.842 |
| 1.555999999999939 | 1.99 | 3.959 | 7.876 |
| 1.556999999999939 | 1.992 | 3.97 | 7.91 |
| 1.557999999999939 | 1.995 | 3.981 | 7.944 |
| 1.558999999999939 | 1.998 | 3.993 | 7.979 |
| 1.559999999999939 | 2.001 | 4.005 | 8.014 |
| 1.560999999999939 | 2.004 | 4.016 | 8.048 |
| 1.561999999999939 | 2.007 | 4.028 | 8.083 |
| 1.562999999999939 | 2.01 | 4.039 | 8.118 |
| 1.563999999999939 | 2.013 | 4.051 | 8.154 |
| 1.564999999999938 | 2.016 | 4.063 | 8.189 |
| 1.565999999999938 | 2.019 | 4.075 | 8.225 |
| 1.566999999999938 | 2.021 | 4.086 | 8.261 |
| 1.567999999999938 | 2.024 | 4.098 | 8.297 |
| 1.568999999999938 | 2.027 | 4.11 | 8.333 |
| 1.569999999999938 | 2.03 | 4.122 | 8.369 |
| 1.570999999999938 | 2.033 | 4.134 | 8.406 |
| 1.571999999999938 | 2.036 | 4.146 | 8.442 |
| 1.572999999999938 | 2.039 | 4.158 | 8.479 |
| 1.573999999999937 | 2.042 | 4.17 | 8.516 |
| 1.574999999999937 | 2.045 | 4.182 | 8.554 |
| 1.575999999999937 | 2.048 | 4.195 | 8.591 |
| 1.576999999999937 | 2.051 | 4.207 | 8.629 |
| 1.577999999999937 | 2.054 | 4.219 | 8.666 |
| 1.578999999999937 | 2.057 | 4.231 | 8.704 |
| 1.579999999999937 | 2.06 | 4.244 | 8.742 |
| 1.580999999999937 | 2.063 | 4.256 | 8.781 |
| 1.581999999999937 | 2.066 | 4.269 | 8.819 |
| 1.582999999999936 | 2.069 | 4.281 | 8.858 |
| 1.583999999999936 | 2.072 | 4.294 | 8.897 |
| 1.584999999999936 | 2.075 | 4.306 | 8.936 |
| 1.585999999999936 | 2.078 | 4.319 | 8.975 |
| 1.586999999999936 | 2.081 | 4.331 | 9.015 |
| 1.587999999999936 | 2.084 | 4.344 | 9.054 |
| 1.588999999999936 | 2.087 | 4.357 | 9.094 |
| 1.589999999999936 | 2.09 | 4.37 | 9.134 |
| 1.590999999999936 | 2.093 | 4.382 | 9.174 |
| 1.591999999999935 | 2.096 | 4.395 | 9.215 |
| 1.592999999999935 | 2.1 | 4.408 | 9.255 |
| 1.593999999999935 | 2.103 | 4.421 | 9.296 |
| 1.594999999999935 | 2.106 | 4.434 | 9.337 |
| 1.595999999999935 | 2.109 | 4.447 | 9.378 |
| 1.596999999999935 | 2.112 | 4.46 | 9.42 |
| 1.597999999999935 | 2.115 | 4.473 | 9.461 |
| 1.598999999999935 | 2.118 | 4.486 | 9.503 |
| 1.599999999999935 | 2.121 | 4.5 | 9.545 |
| 1.600999999999934 | 2.124 | 4.513 | 9.587 |
| 1.601999999999934 | 2.127 | 4.526 | 9.63 |
| 1.602999999999934 | 2.131 | 4.54 | 9.672 |
| 1.603999999999934 | 2.134 | 4.553 | 9.715 |
| 1.604999999999934 | 2.137 | 4.566 | 9.758 |
| 1.605999999999934 | 2.14 | 4.58 | 9.801 |
| 1.606999999999934 | 2.143 | 4.593 | 9.845 |
| 1.607999999999934 | 2.146 | 4.607 | 9.888 |
| 1.608999999999934 | 2.15 | 4.621 | 9.932 |
| 1.609999999999933 | 2.153 | 4.634 | 9.976 |
| 1.610999999999933 | 2.156 | 4.648 | 10.021 |
| 1.611999999999933 | 2.159 | 4.662 | 10.065 |
| 1.612999999999933 | 2.162 | 4.676 | 10.11 |
| 1.613999999999933 | 2.165 | 4.689 | 10.155 |
| 1.614999999999933 | 2.169 | 4.703 | 10.2 |
| 1.615999999999933 | 2.172 | 4.717 | 10.245 |
| 1.616999999999933 | 2.175 | 4.731 | 10.291 |
| 1.617999999999933 | 2.178 | 4.745 | 10.337 |
| 1.618999999999932 | 2.182 | 4.759 | 10.383 |
| 1.619999999999932 | 2.185 | 4.773 | 10.429 |
| 1.620999999999932 | 2.188 | 4.788 | 10.476 |
| 1.621999999999932 | 2.191 | 4.802 | 10.522 |
| 1.622999999999932 | 2.195 | 4.816 | 10.569 |
| 1.623999999999932 | 2.198 | 4.83 | 10.616 |
| 1.624999999999932 | 2.201 | 4.845 | 10.664 |
| 1.625999999999932 | 2.204 | 4.859 | 10.711 |
| 1.626999999999932 | 2.208 | 4.874 | 10.759 |
| 1.627999999999931 | 2.211 | 4.888 | 10.807 |
| 1.628999999999931 | 2.214 | 4.903 | 10.856 |
| 1.629999999999931 | 2.218 | 4.917 | 10.904 |
| 1.630999999999931 | 2.221 | 4.932 | 10.953 |
| 1.631999999999931 | 2.224 | 4.947 | 11.002 |
| 1.632999999999931 | 2.227 | 4.961 | 11.051 |
| 1.633999999999931 | 2.231 | 4.976 | 11.101 |
| 1.634999999999931 | 2.234 | 4.991 | 11.151 |
| 1.635999999999931 | 2.237 | 5.006 | 11.201 |
| 1.63699999999993 | 2.241 | 5.021 | 11.251 |
| 1.63799999999993 | 2.244 | 5.036 | 11.302 |
| 1.63899999999993 | 2.247 | 5.051 | 11.352 |
| 1.63999999999993 | 2.251 | 5.066 | 11.403 |
| 1.64099999999993 | 2.254 | 5.081 | 11.455 |
| 1.64199999999993 | 2.258 | 5.097 | 11.506 |
| 1.64299999999993 | 2.261 | 5.112 | 11.558 |
| 1.64399999999993 | 2.264 | 5.127 | 11.61 |
| 1.64499999999993 | 2.268 | 5.143 | 11.662 |
| 1.645999999999929 | 2.271 | 5.158 | 11.715 |
| 1.646999999999929 | 2.275 | 5.174 | 11.767 |
| 1.647999999999929 | 2.278 | 5.189 | 11.821 |
| 1.648999999999929 | 2.281 | 5.205 | 11.874 |
| 1.649999999999929 | 2.285 | 5.22 | 11.927 |
| 1.650999999999929 | 2.288 | 5.236 | 11.981 |
| 1.651999999999929 | 2.292 | 5.252 | 12.035 |
| 1.652999999999929 | 2.295 | 5.268 | 12.09 |
| 1.653999999999929 | 2.299 | 5.283 | 12.144 |
| 1.654999999999928 | 2.302 | 5.299 | 12.199 |
| 1.655999999999928 | 2.305 | 5.315 | 12.254 |
| 1.656999999999928 | 2.309 | 5.331 | 12.31 |
| 1.657999999999928 | 2.312 | 5.347 | 12.366 |
| 1.658999999999928 | 2.316 | 5.364 | 12.422 |
| 1.659999999999928 | 2.319 | 5.38 | 12.478 |
| 1.660999999999928 | 2.323 | 5.396 | 12.534 |
| 1.661999999999928 | 2.326 | 5.412 | 12.591 |
| 1.662999999999928 | 2.33 | 5.429 | 12.648 |
| 1.663999999999927 | 2.333 | 5.445 | 12.706 |
| 1.664999999999927 | 2.337 | 5.461 | 12.763 |
| 1.665999999999927 | 2.341 | 5.478 | 12.821 |
| 1.666999999999927 | 2.344 | 5.495 | 12.88 |
| 1.667999999999927 | 2.348 | 5.511 | 12.938 |
| 1.668999999999927 | 2.351 | 5.528 | 12.997 |
| 1.669999999999927 | 2.355 | 5.545 | 13.056 |
| 1.670999999999927 | 2.358 | 5.561 | 13.115 |
| 1.671999999999927 | 2.362 | 5.578 | 13.175 |
| 1.672999999999926 | 2.365 | 5.595 | 13.235 |
| 1.673999999999926 | 2.369 | 5.612 | 13.295 |
| 1.674999999999926 | 2.373 | 5.629 | 13.356 |
| 1.675999999999926 | 2.376 | 5.646 | 13.417 |
| 1.676999999999926 | 2.38 | 5.663 | 13.478 |
| 1.677999999999926 | 2.383 | 5.681 | 13.54 |
| 1.678999999999926 | 2.387 | 5.698 | 13.601 |
| 1.679999999999926 | 2.391 | 5.715 | 13.663 |
| 1.680999999999926 | 2.394 | 5.733 | 13.726 |
| 1.681999999999925 | 2.398 | 5.75 | 13.789 |
| 1.682999999999925 | 2.402 | 5.768 | 13.852 |
| 1.683999999999925 | 2.405 | 5.785 | 13.915 |
| 1.684999999999925 | 2.409 | 5.803 | 13.979 |
| 1.685999999999925 | 2.413 | 5.821 | 14.043 |
| 1.686999999999925 | 2.416 | 5.838 | 14.107 |
| 1.687999999999925 | 2.42 | 5.856 | 14.171 |
| 1.688999999999925 | 2.424 | 5.874 | 14.236 |
| 1.689999999999925 | 2.427 | 5.892 | 14.302 |
| 1.690999999999924 | 2.431 | 5.91 | 14.367 |
| 1.691999999999924 | 2.435 | 5.928 | 14.433 |
| 1.692999999999924 | 2.438 | 5.946 | 14.499 |
| 1.693999999999924 | 2.442 | 5.964 | 14.566 |
| 1.694999999999924 | 2.446 | 5.983 | 14.633 |
| 1.695999999999924 | 2.45 | 6.001 | 14.7 |
| 1.696999999999924 | 2.453 | 6.019 | 14.768 |
| 1.697999999999924 | 2.457 | 6.038 | 14.836 |
| 1.698999999999924 | 2.461 | 6.056 | 14.904 |
| 1.699999999999923 | 2.465 | 6.075 | 14.972 |
| 1.700999999999923 | 2.468 | 6.093 | 15.041 |
| 1.701999999999923 | 2.472 | 6.112 | 15.111 |
| 1.702999999999923 | 2.476 | 6.131 | 15.18 |
| 1.703999999999923 | 2.48 | 6.15 | 15.25 |
| 1.704999999999923 | 2.484 | 6.169 | 15.32 |
| 1.705999999999923 | 2.487 | 6.187 | 15.391 |
| 1.706999999999923 | 2.491 | 6.206 | 15.462 |
| 1.707999999999923 | 2.495 | 6.226 | 15.533 |
| 1.708999999999923 | 2.499 | 6.245 | 15.605 |
| 1.709999999999922 | 2.503 | 6.264 | 15.677 |
| 1.710999999999922 | 2.507 | 6.283 | 15.75 |
| 1.711999999999922 | 2.51 | 6.303 | 15.823 |
| 1.712999999999922 | 2.514 | 6.322 | 15.896 |
| 1.713999999999922 | 2.518 | 6.341 | 15.969 |
| 1.714999999999922 | 2.522 | 6.361 | 16.043 |
| 1.715999999999922 | 2.526 | 6.381 | 16.117 |
| 1.716999999999922 | 2.53 | 6.4 | 16.192 |
| 1.717999999999922 | 2.534 | 6.42 | 16.267 |
| 1.718999999999921 | 2.538 | 6.44 | 16.342 |
| 1.719999999999921 | 2.542 | 6.46 | 16.418 |
| 1.720999999999921 | 2.546 | 6.48 | 16.494 |
| 1.721999999999921 | 2.549 | 6.5 | 16.571 |
| 1.722999999999921 | 2.553 | 6.52 | 16.648 |
| 1.723999999999921 | 2.557 | 6.54 | 16.725 |
| 1.724999999999921 | 2.561 | 6.56 | 16.803 |
| 1.725999999999921 | 2.565 | 6.581 | 16.881 |
| 1.726999999999921 | 2.569 | 6.601 | 16.959 |
| 1.72799999999992 | 2.573 | 6.621 | 17.038 |
| 1.72899999999992 | 2.577 | 6.642 | 17.118 |
| 1.72999999999992 | 2.581 | 6.663 | 17.197 |
| 1.73099999999992 | 2.585 | 6.683 | 17.277 |
| 1.73199999999992 | 2.589 | 6.704 | 17.358 |
| 1.73299999999992 | 2.593 | 6.725 | 17.439 |
| 1.73399999999992 | 2.597 | 6.746 | 17.52 |
| 1.73499999999992 | 2.601 | 6.767 | 17.602 |
| 1.73599999999992 | 2.605 | 6.788 | 17.684 |
| 1.736999999999919 | 2.609 | 6.809 | 17.766 |
| 1.737999999999919 | 2.613 | 6.83 | 17.849 |
| 1.738999999999919 | 2.617 | 6.851 | 17.933 |
| 1.739999999999919 | 2.622 | 6.872 | 18.016 |
| 1.740999999999919 | 2.626 | 6.894 | 18.101 |
| 1.741999999999919 | 2.63 | 6.915 | 18.185 |
| 1.742999999999919 | 2.634 | 6.937 | 18.27 |
| 1.743999999999919 | 2.638 | 6.958 | 18.356 |
| 1.744999999999919 | 2.642 | 6.98 | 18.442 |
| 1.745999999999918 | 2.646 | 7.002 | 18.528 |
| 1.746999999999918 | 2.65 | 7.024 | 18.615 |
| 1.747999999999918 | 2.654 | 7.046 | 18.702 |
| 1.748999999999918 | 2.659 | 7.068 | 18.79 |
| 1.749999999999918 | 2.663 | 7.09 | 18.878 |
| 1.750999999999918 | 2.667 | 7.112 | 18.966 |
| 1.751999999999918 | 2.671 | 7.134 | 19.055 |
| 1.752999999999918 | 2.675 | 7.156 | 19.145 |
| 1.753999999999918 | 2.679 | 7.179 | 19.235 |
| 1.754999999999917 | 2.684 | 7.201 | 19.325 |
| 1.755999999999917 | 2.688 | 7.224 | 19.416 |
| 1.756999999999917 | 2.692 | 7.246 | 19.507 |
| 1.757999999999917 | 2.696 | 7.269 | 19.599 |
| 1.758999999999917 | 2.7 | 7.292 | 19.691 |
| 1.759999999999917 | 2.705 | 7.315 | 19.784 |
| 1.760999999999917 | 2.709 | 7.338 | 19.877 |
| 1.761999999999917 | 2.713 | 7.361 | 19.97 |
| 1.762999999999917 | 2.717 | 7.384 | 20.065 |
| 1.763999999999916 | 2.722 | 7.407 | 20.159 |
| 1.764999999999916 | 2.726 | 7.43 | 20.254 |
| 1.765999999999916 | 2.73 | 7.454 | 20.35 |
| 1.766999999999916 | 2.734 | 7.477 | 20.446 |
| 1.767999999999916 | 2.739 | 7.501 | 20.542 |
| 1.768999999999916 | 2.743 | 7.524 | 20.639 |
| 1.769999999999916 | 2.747 | 7.548 | 20.737 |
| 1.770999999999916 | 2.752 | 7.572 | 20.835 |
| 1.771999999999916 | 2.756 | 7.595 | 20.933 |
| 1.772999999999915 | 2.76 | 7.619 | 21.032 |
| 1.773999999999915 | 2.765 | 7.643 | 21.132 |
| 1.774999999999915 | 2.769 | 7.668 | 21.232 |
| 1.775999999999915 | 2.773 | 7.692 | 21.332 |
| 1.776999999999915 | 2.778 | 7.716 | 21.433 |
| 1.777999999999915 | 2.782 | 7.74 | 21.535 |
| 1.778999999999915 | 2.787 | 7.765 | 21.637 |
| 1.779999999999915 | 2.791 | 7.789 | 21.739 |
| 1.780999999999915 | 2.795 | 7.814 | 21.842 |
| 1.781999999999914 | 2.8 | 7.839 | 21.946 |
| 1.782999999999914 | 2.804 | 7.863 | 22.05 |
| 1.783999999999914 | 2.809 | 7.888 | 22.155 |
| 1.784999999999914 | 2.813 | 7.913 | 22.26 |
| 1.785999999999914 | 2.817 | 7.938 | 22.366 |
| 1.786999999999914 | 2.822 | 7.963 | 22.472 |
| 1.787999999999914 | 2.826 | 7.989 | 22.579 |
| 1.788999999999914 | 2.831 | 8.014 | 22.686 |
| 1.789999999999914 | 2.835 | 8.039 | 22.794 |
| 1.790999999999913 | 2.84 | 8.065 | 22.902 |
| 1.791999999999913 | 2.844 | 8.09 | 23.012 |
| 1.792999999999913 | 2.849 | 8.116 | 23.121 |
| 1.793999999999913 | 2.853 | 8.142 | 23.231 |
| 1.794999999999913 | 2.858 | 8.168 | 23.342 |
| 1.795999999999913 | 2.862 | 8.193 | 23.453 |
| 1.796999999999913 | 2.867 | 8.22 | 23.565 |
| 1.797999999999913 | 2.872 | 8.246 | 23.677 |
| 1.798999999999913 | 2.876 | 8.272 | 23.79 |
| 1.799999999999912 | 2.881 | 8.298 | 23.904 |
| 1.800999999999912 | 2.885 | 8.325 | 24.018 |
| 1.801999999999912 | 2.89 | 8.351 | 24.133 |
| 1.802999999999912 | 2.894 | 8.378 | 24.248 |
| 1.803999999999912 | 2.899 | 8.404 | 24.364 |
| 1.804999999999912 | 2.904 | 8.431 | 24.481 |
| 1.805999999999912 | 2.908 | 8.458 | 24.598 |
| 1.806999999999912 | 2.913 | 8.485 | 24.716 |
| 1.807999999999912 | 2.918 | 8.512 | 24.834 |
| 1.808999999999912 | 2.922 | 8.539 | 24.953 |
| 1.809999999999911 | 2.927 | 8.566 | 25.072 |
| 1.810999999999911 | 2.932 | 8.594 | 25.192 |
| 1.811999999999911 | 2.936 | 8.621 | 25.313 |
| 1.812999999999911 | 2.941 | 8.649 | 25.435 |
| 1.813999999999911 | 2.946 | 8.676 | 25.557 |
| 1.814999999999911 | 2.95 | 8.704 | 25.679 |
| 1.815999999999911 | 2.955 | 8.732 | 25.803 |
| 1.816999999999911 | 2.96 | 8.76 | 25.926 |
| 1.817999999999911 | 2.964 | 8.788 | 26.051 |
| 1.81899999999991 | 2.969 | 8.816 | 26.176 |
| 1.81999999999991 | 2.974 | 8.844 | 26.302 |
| 1.82099999999991 | 2.979 | 8.873 | 26.429 |
| 1.82199999999991 | 2.983 | 8.901 | 26.556 |
| 1.82299999999991 | 2.988 | 8.93 | 26.683 |
| 1.82399999999991 | 2.993 | 8.958 | 26.812 |
| 1.82499999999991 | 2.998 | 8.987 | 26.941 |
| 1.82599999999991 | 3.003 | 9.016 | 27.071 |
| 1.82699999999991 | 3.007 | 9.045 | 27.201 |
| 1.827999999999909 | 3.012 | 9.074 | 27.332 |
| 1.828999999999909 | 3.017 | 9.103 | 27.464 |
| 1.829999999999909 | 3.022 | 9.132 | 27.597 |
| 1.830999999999909 | 3.027 | 9.161 | 27.73 |
| 1.831999999999909 | 3.032 | 9.191 | 27.864 |
| 1.832999999999909 | 3.037 | 9.22 | 27.998 |
| 1.833999999999909 | 3.041 | 9.25 | 28.133 |
| 1.834999999999909 | 3.046 | 9.28 | 28.269 |
| 1.835999999999909 | 3.051 | 9.31 | 28.406 |
| 1.836999999999908 | 3.056 | 9.34 | 28.543 |
| 1.837999999999908 | 3.061 | 9.37 | 28.681 |
| 1.838999999999908 | 3.066 | 9.4 | 28.82 |
| 1.839999999999908 | 3.071 | 9.43 | 28.96 |
| 1.840999999999908 | 3.076 | 9.461 | 29.1 |
| 1.841999999999908 | 3.081 | 9.491 | 29.241 |
| 1.842999999999908 | 3.086 | 9.522 | 29.383 |
| 1.843999999999908 | 3.091 | 9.553 | 29.525 |
| 1.844999999999908 | 3.096 | 9.584 | 29.668 |
| 1.845999999999907 | 3.101 | 9.615 | 29.812 |
| 1.846999999999907 | 3.106 | 9.646 | 29.957 |
| 1.847999999999907 | 3.111 | 9.677 | 30.102 |
| 1.848999999999907 | 3.116 | 9.708 | 30.248 |
| 1.849999999999907 | 3.121 | 9.739 | 30.395 |
| 1.850999999999907 | 3.126 | 9.771 | 30.543 |
| 1.851999999999907 | 3.131 | 9.803 | 30.691 |
| 1.852999999999907 | 3.136 | 9.834 | 30.84 |
| 1.853999999999907 | 3.141 | 9.866 | 30.99 |
| 1.854999999999906 | 3.146 | 9.898 | 31.141 |
| 1.855999999999906 | 3.151 | 9.93 | 31.293 |
| 1.856999999999906 | 3.156 | 9.962 | 31.445 |
| 1.857999999999906 | 3.161 | 9.995 | 31.598 |
| 1.858999999999906 | 3.167 | 10.027 | 31.752 |
| 1.859999999999906 | 3.172 | 10.06 | 31.907 |
| 1.860999999999906 | 3.177 | 10.092 | 32.062 |
| 1.861999999999906 | 3.182 | 10.125 | 32.219 |
| 1.862999999999906 | 3.187 | 10.158 | 32.376 |
| 1.863999999999905 | 3.192 | 10.191 | 32.534 |
| 1.864999999999905 | 3.198 | 10.224 | 32.692 |
| 1.865999999999905 | 3.203 | 10.258 | 32.852 |
| 1.866999999999905 | 3.208 | 10.291 | 33.013 |
| 1.867999999999905 | 3.213 | 10.324 | 33.174 |
| 1.868999999999905 | 3.218 | 10.358 | 33.336 |
| 1.869999999999905 | 3.224 | 10.392 | 33.499 |
| 1.870999999999905 | 3.229 | 10.426 | 33.663 |
| 1.871999999999905 | 3.234 | 10.46 | 33.827 |
| 1.872999999999904 | 3.239 | 10.494 | 33.993 |
| 1.873999999999904 | 3.245 | 10.528 | 34.159 |
| 1.874999999999904 | 3.25 | 10.562 | 34.327 |
| 1.875999999999904 | 3.255 | 10.597 | 34.495 |
| 1.876999999999904 | 3.261 | 10.631 | 34.664 |
| 1.877999999999904 | 3.266 | 10.666 | 34.834 |
| 1.878999999999904 | 3.271 | 10.701 | 35.005 |
| 1.879999999999904 | 3.277 | 10.736 | 35.176 |
| 1.880999999999904 | 3.282 | 10.771 | 35.349 |
| 1.881999999999903 | 3.287 | 10.806 | 35.522 |
| 1.882999999999903 | 3.293 | 10.841 | 35.697 |
| 1.883999999999903 | 3.298 | 10.877 | 35.872 |
| 1.884999999999903 | 3.303 | 10.912 | 36.048 |
| 1.885999999999903 | 3.309 | 10.948 | 36.226 |
| 1.886999999999903 | 3.314 | 10.984 | 36.404 |
| 1.887999999999903 | 3.32 | 11.02 | 36.583 |
| 1.888999999999903 | 3.325 | 11.056 | 36.763 |
| 1.889999999999903 | 3.331 | 11.092 | 36.944 |
| 1.890999999999902 | 3.336 | 11.129 | 37.125 |
| 1.891999999999902 | 3.341 | 11.165 | 37.308 |
| 1.892999999999902 | 3.347 | 11.202 | 37.492 |
| 1.893999999999902 | 3.352 | 11.239 | 37.677 |
| 1.894999999999902 | 3.358 | 11.276 | 37.862 |
| 1.895999999999902 | 3.363 | 11.313 | 38.049 |
| 1.896999999999902 | 3.369 | 11.35 | 38.237 |
| 1.897999999999902 | 3.374 | 11.387 | 38.425 |
| 1.898999999999902 | 3.38 | 11.425 | 38.615 |
| 1.899999999999901 | 3.386 | 11.462 | 38.806 |
| 1.900999999999901 | 3.391 | 11.5 | 38.997 |
| 1.901999999999901 | 3.397 | 11.538 | 39.19 |
| 1.902999999999901 | 3.402 | 11.576 | 39.384 |
| 1.903999999999901 | 3.408 | 11.614 | 39.578 |
| 1.904999999999901 | 3.414 | 11.652 | 39.774 |
| 1.905999999999901 | 3.419 | 11.69 | 39.971 |
| 1.906999999999901 | 3.425 | 11.729 | 40.169 |
| 1.907999999999901 | 3.43 | 11.768 | 40.367 |
| 1.908999999999901 | 3.436 | 11.806 | 40.567 |
| 1.9099999999999 | 3.442 | 11.845 | 40.768 |
| 1.9109999999999 | 3.447 | 11.884 | 40.97 |
| 1.9119999999999 | 3.453 | 11.924 | 41.173 |
| 1.9129999999999 | 3.459 | 11.963 | 41.377 |
| 1.9139999999999 | 3.464 | 12.003 | 41.582 |
| 1.9149999999999 | 3.47 | 12.042 | 41.789 |
| 1.9159999999999 | 3.476 | 12.082 | 41.996 |
| 1.9169999999999 | 3.482 | 12.122 | 42.205 |
| 1.9179999999999 | 3.487 | 12.162 | 42.414 |
| 1.918999999999899 | 3.493 | 12.202 | 42.625 |
| 1.919999999999899 | 3.499 | 12.243 | 42.837 |
| 1.920999999999899 | 3.505 | 12.283 | 43.05 |
| 1.921999999999899 | 3.511 | 12.324 | 43.264 |
| 1.922999999999899 | 3.516 | 12.365 | 43.479 |
| 1.923999999999899 | 3.522 | 12.406 | 43.695 |
| 1.924999999999899 | 3.528 | 12.447 | 43.912 |
| 1.925999999999899 | 3.534 | 12.488 | 44.131 |
| 1.926999999999899 | 3.54 | 12.53 | 44.351 |
| 1.927999999999898 | 3.546 | 12.571 | 44.572 |
| 1.928999999999898 | 3.551 | 12.613 | 44.794 |
| 1.929999999999898 | 3.557 | 12.655 | 45.017 |
| 1.930999999999898 | 3.563 | 12.697 | 45.241 |
| 1.931999999999898 | 3.569 | 12.739 | 45.467 |
| 1.932999999999898 | 3.575 | 12.781 | 45.694 |
| 1.933999999999898 | 3.581 | 12.824 | 45.922 |
| 1.934999999999898 | 3.587 | 12.866 | 46.151 |
| 1.935999999999898 | 3.593 | 12.909 | 46.382 |
| 1.936999999999897 | 3.599 | 12.952 | 46.613 |
| 1.937999999999897 | 3.605 | 12.995 | 46.846 |
| 1.938999999999897 | 3.611 | 13.038 | 47.08 |
| 1.939999999999897 | 3.617 | 13.082 | 47.316 |
| 1.940999999999897 | 3.623 | 13.125 | 47.552 |
| 1.941999999999897 | 3.629 | 13.169 | 47.79 |
| 1.942999999999897 | 3.635 | 13.213 | 48.029 |
| 1.943999999999897 | 3.641 | 13.257 | 48.27 |
| 1.944999999999897 | 3.647 | 13.301 | 48.512 |
| 1.945999999999896 | 3.653 | 13.346 | 48.755 |
| 1.946999999999896 | 3.659 | 13.39 | 48.999 |
| 1.947999999999896 | 3.665 | 13.435 | 49.245 |
| 1.948999999999896 | 3.671 | 13.48 | 49.491 |
| 1.949999999999896 | 3.678 | 13.525 | 49.74 |
| 1.950999999999896 | 3.684 | 13.57 | 49.989 |
| 1.951999999999896 | 3.69 | 13.615 | 50.24 |
| 1.952999999999896 | 3.696 | 13.661 | 50.492 |
| 1.953999999999896 | 3.702 | 13.707 | 50.746 |
| 1.954999999999895 | 3.708 | 13.753 | 51.001 |
| 1.955999999999895 | 3.715 | 13.799 | 51.257 |
| 1.956999999999895 | 3.721 | 13.845 | 51.515 |
| 1.957999999999895 | 3.727 | 13.891 | 51.774 |
| 1.958999999999895 | 3.733 | 13.938 | 52.034 |
| 1.959999999999895 | 3.74 | 13.984 | 52.296 |
| 1.960999999999895 | 3.746 | 14.031 | 52.559 |
| 1.961999999999895 | 3.752 | 14.078 | 52.823 |
| 1.962999999999895 | 3.758 | 14.126 | 53.089 |
| 1.963999999999894 | 3.765 | 14.173 | 53.357 |
| 1.964999999999894 | 3.771 | 14.22 | 53.626 |
| 1.965999999999894 | 3.777 | 14.268 | 53.896 |
| 1.966999999999894 | 3.784 | 14.316 | 54.168 |
| 1.967999999999894 | 3.79 | 14.364 | 54.441 |
| 1.968999999999894 | 3.796 | 14.413 | 54.715 |
| 1.969999999999894 | 3.803 | 14.461 | 54.991 |
| 1.970999999999894 | 3.809 | 14.51 | 55.269 |
| 1.971999999999894 | 3.816 | 14.558 | 55.548 |
| 1.972999999999893 | 3.822 | 14.607 | 55.829 |
| 1.973999999999893 | 3.828 | 14.657 | 56.111 |
| 1.974999999999893 | 3.835 | 14.706 | 56.394 |
| 1.975999999999893 | 3.841 | 14.755 | 56.679 |
| 1.976999999999893 | 3.848 | 14.805 | 56.966 |
| 1.977999999999893 | 3.854 | 14.855 | 57.254 |
| 1.978999999999893 | 3.861 | 14.905 | 57.544 |
| 1.979999999999893 | 3.867 | 14.955 | 57.835 |
| 1.980999999999893 | 3.874 | 15.006 | 58.128 |
| 1.981999999999892 | 3.88 | 15.056 | 58.422 |
| 1.982999999999892 | 3.887 | 15.107 | 58.718 |
| 1.983999999999892 | 3.893 | 15.158 | 59.016 |
| 1.984999999999892 | 3.9 | 15.209 | 59.315 |
| 1.985999999999892 | 3.906 | 15.261 | 59.616 |
| 1.986999999999892 | 3.913 | 15.312 | 59.918 |
| 1.987999999999892 | 3.92 | 15.364 | 60.222 |
| 1.988999999999892 | 3.926 | 15.416 | 60.528 |
| 1.989999999999892 | 3.933 | 15.468 | 60.835 |
| 1.990999999999891 | 3.94 | 15.52 | 61.144 |
| 1.991999999999891 | 3.946 | 15.573 | 61.454 |
| 1.992999999999891 | 3.953 | 15.626 | 61.767 |
| 1.993999999999891 | 3.96 | 15.678 | 62.081 |
| 1.994999999999891 | 3.966 | 15.732 | 62.396 |
| 1.995999999999891 | 3.973 | 15.785 | 62.714 |
| 1.996999999999891 | 3.98 | 15.838 | 63.033 |
| 1.997999999999891 | 3.986 | 15.892 | 63.353 |
| 1.998999999999891 | 3.993 | 15.946 | 63.676 |
| 1.99999999999989 | 4 | 16 | 64 |